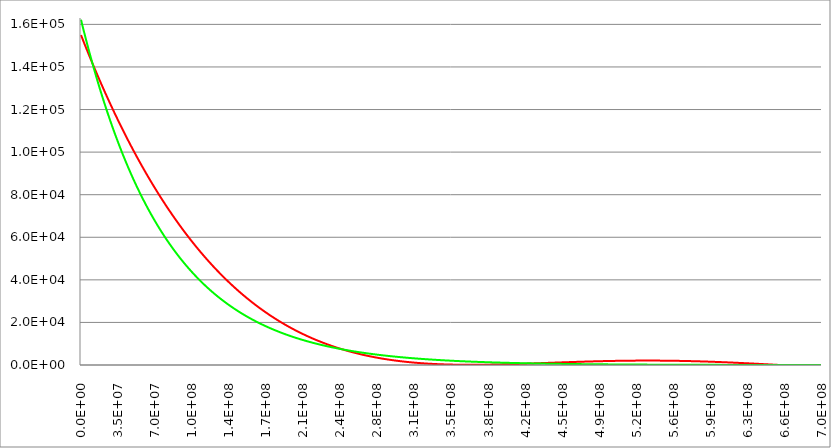
| Category | Series 1 | Series 0 | Series 2 |
|---|---|---|---|
| 0.0 | 155000 | 162200 |  |
| 347850.0 | 154555.961 | 161490.775 |  |
| 695700.0 | 154112.842 | 160784.651 |  |
| 1043550.0 | 153670.644 | 160081.614 |  |
| 1391400.0 | 153229.363 | 159381.651 |  |
| 1739250.0 | 152789 | 158684.748 |  |
| 2087100.0 | 152349.552 | 157990.891 |  |
| 2434950.0 | 151911.019 | 157300.068 |  |
| 2782800.0 | 151473.4 | 156612.265 |  |
| 3130650.0 | 151036.693 | 155927.469 |  |
| 3478500.0 | 150600.897 | 155245.667 |  |
| 3826350.0 | 150166.01 | 154566.846 |  |
| 4174200.0 | 149732.033 | 153890.992 |  |
| 4522050.0 | 149298.962 | 153218.093 |  |
| 4869900.0 | 148866.798 | 152548.136 |  |
| 5217750.0 | 148435.539 | 151881.108 |  |
| 5565600.0 | 148005.184 | 151216.996 |  |
| 5913450.0 | 147575.731 | 150555.787 |  |
| 6261300.0 | 147147.179 | 149897.47 |  |
| 6609150.0 | 146719.528 | 149242.03 |  |
| 6957000.0 | 146292.775 | 148589.455 |  |
| 7304850.0 | 145866.92 | 147939.734 |  |
| 7652700.0 | 145441.962 | 147292.853 |  |
| 8000550.0 | 145017.899 | 146648.8 |  |
| 8348400.0 | 144594.73 | 146007.563 |  |
| 8696250.0 | 144172.454 | 145369.129 |  |
| 9044100.0 | 143751.07 | 144733.487 |  |
| 9391950.0 | 143330.576 | 144100.623 |  |
| 9739800.0 | 142910.971 | 143470.526 |  |
| 10087650.0 | 142492.255 | 142843.184 |  |
| 10435500.0 | 142074.425 | 142218.584 |  |
| 10783350.0 | 141657.481 | 141596.715 |  |
| 11131200.0 | 141241.422 | 140977.565 |  |
| 11479050.0 | 140826.245 | 140361.122 |  |
| 11826900.0 | 140411.951 | 139747.373 |  |
| 12174750.0 | 139998.538 | 139136.308 |  |
| 12522600.0 | 139586.004 | 138527.914 |  |
| 12870450.0 | 139174.349 | 137922.18 |  |
| 13218300.0 | 138763.571 | 137319.095 |  |
| 13566150.0 | 138353.67 | 136718.646 |  |
| 13914000.0 | 137944.643 | 136120.822 |  |
| 14261850.0 | 137536.49 | 135525.611 |  |
| 14609700.0 | 137129.21 | 134933.003 |  |
| 14957550.0 | 136722.8 | 134342.985 |  |
| 15305400.0 | 136317.261 | 133755.547 |  |
| 15653250.0 | 135912.591 | 133170.677 |  |
| 16001100.0 | 135508.789 | 132588.365 |  |
| 16348950.0 | 135105.853 | 132008.598 |  |
| 16696800.0 | 134703.783 | 131431.365 |  |
| 17044650.0 | 134302.577 | 130856.656 |  |
| 17392500.0 | 133902.234 | 130284.46 |  |
| 17740350.0 | 133502.753 | 129714.765 |  |
| 18088200.0 | 133104.132 | 129147.561 |  |
| 18436050.0 | 132706.371 | 128582.837 |  |
| 18783900.0 | 132309.469 | 128020.581 |  |
| 19131750.0 | 131913.423 | 127460.784 |  |
| 19479600.0 | 131518.233 | 126903.434 |  |
| 19827450.0 | 131123.898 | 126348.52 |  |
| 20175300.0 | 130730.417 | 125796.033 |  |
| 20523150.0 | 130337.788 | 125245.961 |  |
| 20871000.0 | 129946.01 | 124698.293 |  |
| 21218850.0 | 129555.083 | 124153.021 |  |
| 21566700.0 | 129165.004 | 123610.132 |  |
| 21914550.0 | 128775.773 | 123069.616 |  |
| 22262400.0 | 128387.388 | 122531.463 |  |
| 22610250.0 | 127999.849 | 121995.664 |  |
| 22958100.0 | 127613.154 | 121462.206 |  |
| 23305950.0 | 127227.302 | 120931.081 |  |
| 23653800.0 | 126842.292 | 120402.278 |  |
| 24001650.0 | 126458.123 | 119875.786 |  |
| 24349500.0 | 126074.793 | 119351.597 |  |
| 24697350.0 | 125692.301 | 118829.699 |  |
| 25045200.0 | 125310.646 | 118310.082 |  |
| 25393050.0 | 124929.828 | 117792.738 |  |
| 25740900.0 | 124549.844 | 117277.655 |  |
| 26088750.0 | 124170.694 | 116764.824 |  |
| 26436600.0 | 123792.377 | 116254.235 |  |
| 26784450.0 | 123414.891 | 115745.878 |  |
| 27132300.0 | 123038.235 | 115239.744 |  |
| 27480150.0 | 122662.408 | 114735.822 |  |
| 27828000.0 | 122287.409 | 114234.104 |  |
| 28175850.0 | 121913.236 | 113734.579 |  |
| 28523700.0 | 121539.889 | 113237.238 |  |
| 28871550.0 | 121167.367 | 112742.071 |  |
| 29219400.0 | 120795.668 | 112249.069 |  |
| 29567250.0 | 120424.79 | 111758.222 |  |
| 29915100.0 | 120054.734 | 111269.521 |  |
| 30262950.0 | 119685.497 | 110782.957 |  |
| 30610800.0 | 119317.079 | 110298.52 |  |
| 30958650.0 | 118949.479 | 109816.2 |  |
| 31306500.0 | 118582.694 | 109335.99 |  |
| 31654350.0 | 118216.725 | 108857.878 |  |
| 32002200.0 | 117851.57 | 108381.857 |  |
| 32350050.0 | 117487.228 | 107907.917 |  |
| 32697900.0 | 117123.697 | 107436.049 |  |
| 33045750.0 | 116760.977 | 106966.244 |  |
| 33393600.0 | 116399.066 | 106498.493 |  |
| 33741450.0 | 116037.964 | 106032.787 |  |
| 34089300.0 | 115677.668 | 105569.117 |  |
| 34437150.0 | 115318.179 | 105107.474 |  |
| 34785000.0 | 114959.494 | 104647.849 |  |
| 35132850.0 | 114601.613 | 104190.234 |  |
| 35480700.0 | 114244.534 | 103734.619 |  |
| 35828550.0 | 113888.257 | 103280.996 |  |
| 36176400.0 | 113532.78 | 102829.356 |  |
| 36524250.0 | 113178.102 | 102379.691 |  |
| 36872100.0 | 112824.222 | 101931.992 |  |
| 37219950.0 | 112471.138 | 101486.25 |  |
| 37567800.0 | 112118.851 | 101042.456 |  |
| 37915650.0 | 111767.358 | 100600.603 |  |
| 38263500.0 | 111416.658 | 100160.682 |  |
| 38611350.0 | 111066.75 | 99722.684 |  |
| 38959200.0 | 110717.634 | 99286.6 |  |
| 39307050.0 | 110369.308 | 98852.423 |  |
| 39654900.0 | 110021.77 | 98420.145 |  |
| 40002750.0 | 109675.02 | 97989.756 |  |
| 40350600.0 | 109329.057 | 97561.249 |  |
| 40698450.0 | 108983.879 | 97134.615 |  |
| 41046300.0 | 108639.485 | 96709.846 |  |
| 41394150.0 | 108295.875 | 96286.934 |  |
| 41742000.0 | 107953.046 | 95865.872 |  |
| 42089850.0 | 107610.999 | 95446.65 |  |
| 42437700.0 | 107269.731 | 95029.261 |  |
| 42785550.0 | 106929.242 | 94613.696 |  |
| 43133400.0 | 106589.53 | 94199.949 |  |
| 43481250.0 | 106250.595 | 93788.01 |  |
| 43829100.0 | 105912.435 | 93377.872 |  |
| 44176950.0 | 105575.049 | 92969.527 |  |
| 44524800.0 | 105238.437 | 92562.968 |  |
| 44872650.0 | 104902.596 | 92158.185 |  |
| 45220500.0 | 104567.526 | 91755.173 |  |
| 45568350.0 | 104233.225 | 91353.922 |  |
| 45916200.0 | 103899.693 | 90954.426 |  |
| 46264050.0 | 103566.929 | 90556.676 |  |
| 46611900.0 | 103234.931 | 90160.665 |  |
| 46959750.0 | 102903.698 | 89766.386 |  |
| 47307600.0 | 102573.229 | 89373.83 |  |
| 47655450.0 | 102243.523 | 88982.99 |  |
| 48003300.0 | 101914.579 | 88593.859 |  |
| 48351150.0 | 101586.395 | 88206.429 |  |
| 48699000.0 | 101258.971 | 87820.693 |  |
| 49046850.0 | 100932.306 | 87436.643 |  |
| 49394700.0 | 100606.398 | 87054.273 |  |
| 49742550.0 | 100281.246 | 86673.574 |  |
| 50090400.0 | 99956.849 | 86294.539 |  |
| 50438250.0 | 99633.207 | 85917.162 |  |
| 50786100.0 | 99310.317 | 85541.434 |  |
| 51133950.0 | 98988.179 | 85167.349 |  |
| 51481800.0 | 98666.792 | 84794.899 |  |
| 51829650.0 | 98346.154 | 84424.078 |  |
| 52177500.0 | 98026.265 | 84054.878 |  |
| 52525350.0 | 97707.124 | 83687.292 |  |
| 52873200.0 | 97388.728 | 83321.313 |  |
| 53221050.0 | 97071.078 | 82956.934 |  |
| 53568900.0 | 96754.172 | 82594.148 |  |
| 53916750.0 | 96438.008 | 82232.948 |  |
| 54264600.0 | 96122.587 | 81873.327 |  |
| 54612450.0 | 95807.906 | 81515.278 |  |
| 54960300.0 | 95493.966 | 81158.795 |  |
| 55308150.0 | 95180.763 | 80803.87 |  |
| 55656000.0 | 94868.298 | 80450.497 |  |
| 56003850.0 | 94556.57 | 80098.669 |  |
| 56351700.0 | 94245.576 | 79748.378 |  |
| 56699550.0 | 93935.317 | 79399.62 |  |
| 57047400.0 | 93625.791 | 79052.386 |  |
| 57395250.0 | 93316.997 | 78706.67 |  |
| 57743100.0 | 93008.934 | 78362.465 |  |
| 58090950.0 | 92701.601 | 78019.766 |  |
| 58438800.0 | 92394.996 | 77678.564 |  |
| 58786650.0 | 92089.119 | 77338.854 |  |
| 59134500.0 | 91783.968 | 77000.63 |  |
| 59482350.0 | 91479.543 | 76663.884 |  |
| 59830200.0 | 91175.842 | 76328.61 |  |
| 60178050.0 | 90872.865 | 75994.802 |  |
| 60525900.0 | 90570.609 | 75662.453 |  |
| 60873750.0 | 90269.075 | 75331.558 |  |
| 61221600.0 | 89968.261 | 75002.109 |  |
| 61569450.0 | 89668.165 | 74674.1 |  |
| 61917300.0 | 89368.788 | 74347.525 |  |
| 62265150.0 | 89070.127 | 74022.378 |  |
| 62613000.0 | 88772.182 | 73698.653 |  |
| 62960850.0 | 88474.951 | 73376.342 |  |
| 63308700.0 | 88178.434 | 73055.441 |  |
| 63656550.0 | 87882.629 | 72735.943 |  |
| 64004400.0 | 87587.535 | 72417.842 |  |
| 64352250.0 | 87293.152 | 72101.131 |  |
| 64700100.0 | 86999.478 | 71785.805 |  |
| 65047950.0 | 86706.512 | 71471.857 |  |
| 65395800.0 | 86414.253 | 71159.282 |  |
| 65743650.0 | 86122.7 | 70848.074 |  |
| 66091500.0 | 85831.852 | 70538.226 |  |
| 66439350.0 | 85541.707 | 70229.732 |  |
| 66787200.0 | 85252.265 | 69922.588 |  |
| 67135050.0 | 84963.525 | 69616.786 |  |
| 67482900.0 | 84675.486 | 69312.321 |  |
| 67830750.0 | 84388.146 | 69009.187 |  |
| 68178600.0 | 84101.504 | 68707.379 |  |
| 68526450.0 | 83815.56 | 68406.889 |  |
| 68874300.0 | 83530.312 | 68107.714 |  |
| 69222150.0 | 83245.759 | 67809.846 |  |
| 69570000.0 | 82961.9 | 67513.281 |  |
| 69917850.0 | 82678.734 | 67218.012 |  |
| 70265700.0 | 82396.261 | 66924.035 |  |
| 70613550.0 | 82114.478 | 66631.342 |  |
| 70961400.0 | 81833.385 | 66339.929 |  |
| 71309250.0 | 81552.981 | 66049.79 |  |
| 71657100.0 | 81273.265 | 65760.919 |  |
| 72004950.0 | 80994.235 | 65473.312 |  |
| 72352800.0 | 80715.891 | 65186.961 |  |
| 72700650.0 | 80438.232 | 64901.863 |  |
| 73048500.0 | 80161.256 | 64618.011 |  |
| 73396350.0 | 79884.963 | 64335.4 |  |
| 73744200.0 | 79609.35 | 64054.024 |  |
| 74092050.0 | 79334.419 | 63773.879 |  |
| 74439900.0 | 79060.166 | 63494.958 |  |
| 74787750.0 | 78786.592 | 63217.257 |  |
| 75135600.0 | 78513.695 | 62940.77 |  |
| 75483450.0 | 78241.474 | 62665.492 |  |
| 75831300.0 | 77969.928 | 62391.417 |  |
| 76179150.0 | 77699.056 | 62118.54 |  |
| 76527000.0 | 77428.857 | 61846.856 |  |
| 76874850.0 | 77159.33 | 61576.36 |  |
| 77222700.0 | 76890.473 | 61307.047 |  |
| 77570550.0 | 76622.287 | 61038.911 |  |
| 77918400.0 | 76354.769 | 60771.947 |  |
| 78266250.0 | 76087.919 | 60506.15 |  |
| 78614100.0 | 75821.735 | 60241.516 |  |
| 78961950.0 | 75556.218 | 59978.038 |  |
| 79309800.0 | 75291.364 | 59715.712 |  |
| 79657650.0 | 75027.175 | 59454.533 |  |
| 80005500.0 | 74763.647 | 59194.496 |  |
| 80353350.0 | 74500.781 | 58935.596 |  |
| 80701200.0 | 74238.576 | 58677.828 |  |
| 81049050.0 | 73977.029 | 58421.186 |  |
| 81396900.0 | 73716.142 | 58165.667 |  |
| 81744750.0 | 73455.911 | 57911.264 |  |
| 82092600.0 | 73196.336 | 57657.974 |  |
| 82440450.0 | 72937.417 | 57405.791 |  |
| 82788300.0 | 72679.152 | 57154.711 |  |
| 83136150.0 | 72421.54 | 56904.728 |  |
| 83484000.0 | 72164.58 | 56655.838 |  |
| 83831850.0 | 71908.271 | 56408.037 |  |
| 84179700.0 | 71652.612 | 56161.319 |  |
| 84527550.0 | 71397.602 | 55915.679 |  |
| 84875400.0 | 71143.24 | 55671.113 |  |
| 85223250.0 | 70889.524 | 55427.616 |  |
| 85571100.0 | 70636.455 | 55185.184 |  |
| 85918950.0 | 70384.03 | 54943.812 |  |
| 86266800.0 | 70132.25 | 54703.495 |  |
| 86614650.0 | 69881.112 | 54464.229 |  |
| 86962500.0 | 69630.615 | 54226.009 |  |
| 87310350.0 | 69380.76 | 53988.83 |  |
| 87658200.0 | 69131.544 | 53752.688 |  |
| 88006050.0 | 68882.966 | 53517.579 |  |
| 88353900.0 | 68635.027 | 53283.497 |  |
| 88701750.0 | 68387.724 | 53050.439 |  |
| 89049600.0 | 68141.056 | 52818.399 |  |
| 89397450.0 | 67895.023 | 52587.374 |  |
| 89745300.0 | 67649.624 | 52357.359 |  |
| 90093150.0 | 67404.857 | 52128.35 |  |
| 90441000.0 | 67160.722 | 51900.342 |  |
| 90788850.0 | 66917.217 | 51673.331 |  |
| 91136700.0 | 66674.341 | 51447.312 |  |
| 91484550.0 | 66432.094 | 51222.281 |  |
| 91832400.0 | 66190.474 | 50998.234 |  |
| 92180250.0 | 65949.481 | 50775.167 |  |
| 92528100.0 | 65709.113 | 50553.074 |  |
| 92875950.0 | 65469.37 | 50331.953 |  |
| 93223800.0 | 65230.249 | 50111.798 |  |
| 93571650.0 | 64991.751 | 49892.606 |  |
| 93919500.0 | 64753.875 | 49674.372 |  |
| 94267350.0 | 64516.619 | 49457.093 |  |
| 94615200.0 | 64279.982 | 49240.763 |  |
| 94963050.0 | 64043.963 | 49025.379 |  |
| 95310900.0 | 63808.562 | 48810.936 |  |
| 95658750.0 | 63573.776 | 48597.431 |  |
| 96006600.0 | 63339.606 | 48384.86 |  |
| 96354450.0 | 63106.051 | 48173.218 |  |
| 96702300.0 | 62873.108 | 47962.501 |  |
| 97050150.0 | 62640.778 | 47752.705 |  |
| 97398000.0 | 62409.059 | 47543.827 |  |
| 97745850.0 | 62177.95 | 47335.861 |  |
| 98093700.0 | 61947.451 | 47128.805 |  |
| 98441550.0 | 61717.559 | 46922.654 |  |
| 98789400.0 | 61488.275 | 46717.405 |  |
| 99137250.0 | 61259.597 | 46513.052 |  |
| 99485100.0 | 61031.524 | 46309.593 |  |
| 99832950.0 | 60804.056 | 46107.024 |  |
| 100180800.0 | 60577.191 | 45905.34 |  |
| 100528650.0 | 60350.927 | 45704.538 |  |
| 100876500.0 | 60125.266 | 45504.614 |  |
| 101224350.0 | 59900.204 | 45305.564 |  |
| 101572200.0 | 59675.741 | 45107.384 |  |
| 101920050.0 | 59451.877 | 44910.07 |  |
| 102267900.0 | 59228.61 | 44713.619 |  |
| 102615750.0 | 59005.939 | 44518.027 |  |
| 102963600.0 | 58783.864 | 44323.29 |  |
| 103311450.0 | 58562.382 | 44129.404 |  |
| 103659300.0 | 58341.494 | 43936.366 |  |
| 104007150.0 | 58121.198 | 43744.172 |  |
| 104355000.0 | 57901.494 | 43552.819 |  |
| 104702850.0 | 57682.379 | 43362.301 |  |
| 105050700.0 | 57463.854 | 43172.617 |  |
| 105398550.0 | 57245.918 | 42983.762 |  |
| 105746400.0 | 57028.568 | 42795.733 |  |
| 106094250.0 | 56811.805 | 42608.525 |  |
| 106442100.0 | 56595.628 | 42422.136 |  |
| 106789950.0 | 56380.034 | 42236.562 |  |
| 107137800.0 | 56165.025 | 42051.799 |  |
| 107485650.0 | 55950.597 | 41867.844 |  |
| 107833500.0 | 55736.751 | 41684.694 |  |
| 108181350.0 | 55523.485 | 41502.344 |  |
| 108529200.0 | 55310.799 | 41320.791 |  |
| 108877050.0 | 55098.691 | 41140.032 |  |
| 109224900.0 | 54887.161 | 40960.063 |  |
| 109572750.0 | 54676.207 | 40780.881 |  |
| 109920600.0 | 54465.829 | 40602.482 |  |
| 110268450.0 | 54256.025 | 40424.863 |  |
| 110616300.0 | 54046.795 | 40248.021 |  |
| 110964150.0 | 53838.138 | 40071.952 |  |
| 111312000.0 | 53630.052 | 39896.652 |  |
| 111659850.0 | 53422.537 | 39722.119 |  |
| 112007700.0 | 53215.591 | 39548.349 |  |
| 112355550.0 | 53009.214 | 39375.339 |  |
| 112703400.0 | 52803.405 | 39203.085 |  |
| 113051250.0 | 52598.163 | 39031.584 |  |
| 113399100.0 | 52393.487 | 38860.833 |  |
| 113746950.0 | 52189.375 | 38690.828 |  |
| 114094800.0 | 51985.827 | 38521.567 |  |
| 114442650.0 | 51782.842 | 38353.046 |  |
| 114790500.0 | 51580.419 | 38185.261 |  |
| 115138350.0 | 51378.557 | 38018.21 |  |
| 115486200.0 | 51177.255 | 37851.889 |  |
| 115834050.0 | 50976.512 | 37686.295 |  |
| 116181900.0 | 50776.328 | 37521.426 |  |
| 116529750.0 | 50576.7 | 37357.277 |  |
| 116877600.0 | 50377.628 | 37193.846 |  |
| 117225450.0 | 50179.112 | 37031.129 |  |
| 117573300.0 | 49981.15 | 36869.123 |  |
| 117921150.0 | 49783.741 | 36707.826 |  |
| 118269000.0 | 49586.884 | 36547.234 |  |
| 118616850.0 | 49390.579 | 36387.344 |  |
| 118964700.0 | 49194.824 | 36228.154 |  |
| 119312550.0 | 48999.618 | 36069.659 |  |
| 119660400.0 | 48804.961 | 35911.857 |  |
| 120008250.0 | 48610.852 | 35754.745 |  |
| 120356100.0 | 48417.289 | 35598.319 |  |
| 120703950.0 | 48224.272 | 35442.578 |  |
| 121051800.0 | 48031.799 | 35287.517 |  |
| 121399650.0 | 47839.87 | 35133.135 |  |
| 121747500.0 | 47648.484 | 34979.427 |  |
| 122095350.0 | 47457.64 | 34826.391 |  |
| 122443200.0 | 47267.336 | 34674.025 |  |
| 122791050.0 | 47077.573 | 34522.324 |  |
| 123138900.0 | 46888.348 | 34371.287 |  |
| 123486750.0 | 46699.661 | 34220.91 |  |
| 123834600.0 | 46511.512 | 34071.191 |  |
| 124182450.0 | 46323.898 | 33922.125 |  |
| 124530300.0 | 46136.82 | 33773.712 |  |
| 124878150.0 | 45950.276 | 33625.948 |  |
| 125226000.0 | 45764.265 | 33478.829 |  |
| 125573850.0 | 45578.787 | 33332.354 |  |
| 125921700.0 | 45393.84 | 33186.519 |  |
| 126269550.0 | 45209.424 | 33041.322 |  |
| 126617400.0 | 45025.537 | 32896.759 |  |
| 126965250.0 | 44842.178 | 32752.829 |  |
| 127313100.0 | 44659.347 | 32609.527 |  |
| 127660950.0 | 44477.043 | 32466.852 |  |
| 128008800.0 | 44295.265 | 32324.801 |  |
| 128356650.0 | 44114.012 | 32183.371 |  |
| 128704500.0 | 43933.282 | 32042.559 |  |
| 129052350.0 | 43753.076 | 31902.363 |  |
| 129400200.0 | 43573.391 | 31762.78 |  |
| 129748050.0 | 43394.228 | 31623.807 |  |
| 130095900.0 | 43215.584 | 31485.442 |  |
| 130443750.0 | 43037.46 | 31347.681 |  |
| 130791600.0 | 42859.855 | 31210.523 |  |
| 131139450.0 | 42682.766 | 31073.964 |  |
| 131487300.0 | 42506.194 | 30938.003 |  |
| 131835150.0 | 42330.138 | 30802.636 |  |
| 132183000.0 | 42154.596 | 30667.86 |  |
| 132530850.0 | 41979.568 | 30533.674 |  |
| 132878700.0 | 41805.052 | 30400.075 |  |
| 133226550.0 | 41631.049 | 30267.059 |  |
| 133574400.0 | 41457.556 | 30134.625 |  |
| 133922250.0 | 41284.573 | 30002.77 |  |
| 134270100.0 | 41112.099 | 29871.492 |  |
| 134617950.0 | 40940.134 | 29740.787 |  |
| 134965800.0 | 40768.675 | 29610.654 |  |
| 135313650.0 | 40597.723 | 29481.09 |  |
| 135661500.0 | 40427.276 | 29352.092 |  |
| 136009350.0 | 40257.334 | 29223.658 |  |
| 136357200.0 | 40087.895 | 29095.786 |  |
| 136705050.0 | 39918.959 | 28968.473 |  |
| 137052900.0 | 39750.524 | 28841.716 |  |
| 137400750.0 | 39582.59 | 28715.513 |  |
| 137748600.0 | 39415.156 | 28589.863 |  |
| 138096450.0 | 39248.221 | 28464.761 |  |
| 138444300.0 | 39081.784 | 28340.207 |  |
| 138792150.0 | 38915.844 | 28216.197 |  |
| 139140000.0 | 38750.4 | 28092.729 |  |
| 139487850.0 | 38585.451 | 27969.801 |  |
| 139835700.0 | 38420.997 | 27847.41 |  |
| 140183550.0 | 38257.037 | 27725.554 |  |
| 140531400.0 | 38093.569 | 27604.232 |  |
| 140879250.0 | 37930.592 | 27483.439 |  |
| 141227100.0 | 37768.106 | 27363.175 |  |
| 141574950.0 | 37606.11 | 27243.436 |  |
| 141922800.0 | 37444.603 | 27124.221 |  |
| 142270650.0 | 37283.584 | 27005.527 |  |
| 142618500.0 | 37123.052 | 26887.352 |  |
| 142966350.0 | 36963.007 | 26769.694 |  |
| 143314200.0 | 36803.446 | 26652.55 |  |
| 143662050.0 | 36644.37 | 26535.918 |  |
| 144009900.0 | 36485.778 | 26419.796 |  |
| 144357750.0 | 36327.668 | 26304.182 |  |
| 144705600.0 | 36170.04 | 26189.073 |  |
| 145053450.0 | 36012.893 | 26074.467 |  |
| 145401300.0 | 35856.225 | 25960.363 |  |
| 145749150.0 | 35700.037 | 25846.757 |  |
| 146097000.0 | 35544.326 | 25733.648 |  |
| 146444850.0 | 35389.093 | 25621.034 |  |
| 146792700.0 | 35234.336 | 25508.911 |  |
| 147140550.0 | 35080.055 | 25397.279 |  |
| 147488400.0 | 34926.248 | 25286.135 |  |
| 147836250.0 | 34772.915 | 25175.477 |  |
| 148184100.0 | 34620.055 | 25065.303 |  |
| 148531950.0 | 34467.666 | 24955.61 |  |
| 148879800.0 | 34315.748 | 24846.397 |  |
| 149227650.0 | 34164.301 | 24737.662 |  |
| 149575500.0 | 34013.322 | 24629.401 |  |
| 149923350.0 | 33862.812 | 24521.614 |  |
| 150271200.0 | 33712.77 | 24414.299 |  |
| 150619050.0 | 33563.193 | 24307.452 |  |
| 150966900.0 | 33414.083 | 24201.073 |  |
| 151314750.0 | 33265.437 | 24095.158 |  |
| 151662600.0 | 33117.255 | 23989.707 |  |
| 152010450.0 | 32969.536 | 23884.717 |  |
| 152358300.0 | 32822.279 | 23780.186 |  |
| 152706150.0 | 32675.484 | 23676.111 |  |
| 153054000.0 | 32529.149 | 23572.492 |  |
| 153401850.0 | 32383.273 | 23469.326 |  |
| 153749700.0 | 32237.856 | 23366.61 |  |
| 154097550.0 | 32092.896 | 23264.344 |  |
| 154445400.0 | 31948.393 | 23162.525 |  |
| 154793250.0 | 31804.347 | 23061.151 |  |
| 155141100.0 | 31660.755 | 22960.22 |  |
| 155488950.0 | 31517.618 | 22859.731 |  |
| 155836800.0 | 31374.933 | 22759.681 |  |
| 156184650.0 | 31232.702 | 22660.068 |  |
| 156532500.0 | 31090.921 | 22560.89 |  |
| 156880350.0 | 30949.592 | 22462.147 |  |
| 157228200.0 | 30808.712 | 22363.835 |  |
| 157576050.0 | 30668.282 | 22265.952 |  |
| 157923900.0 | 30528.299 | 22168.498 |  |
| 158271750.0 | 30388.764 | 22071.47 |  |
| 158619600.0 | 30249.675 | 21974.866 |  |
| 158967450.0 | 30111.031 | 21878.684 |  |
| 159315300.0 | 29972.832 | 21782.923 |  |
| 159663150.0 | 29835.077 | 21687.58 |  |
| 160011000.0 | 29697.765 | 21592.655 |  |
| 160358850.0 | 29560.894 | 21498.144 |  |
| 160706700.0 | 29424.465 | 21404.046 |  |
| 161054550.0 | 29288.477 | 21310.36 |  |
| 161402400.0 | 29152.927 | 21217.083 |  |
| 161750250.0 | 29017.816 | 21124.215 |  |
| 162098100.0 | 28883.143 | 21031.752 |  |
| 162445950.0 | 28748.907 | 20939.693 |  |
| 162793800.0 | 28615.106 | 20848.037 |  |
| 163141650.0 | 28481.741 | 20756.782 |  |
| 163489500.0 | 28348.81 | 20665.925 |  |
| 163837350.0 | 28216.313 | 20575.466 |  |
| 164185200.0 | 28084.248 | 20485.402 |  |
| 164533050.0 | 27952.614 | 20395.732 |  |
| 164880900.0 | 27821.412 | 20306.454 |  |
| 165228750.0 | 27690.64 | 20217.567 |  |
| 165576600.0 | 27560.296 | 20129.068 |  |
| 165924450.0 | 27430.381 | 20040.956 |  |
| 166272300.0 | 27300.894 | 19953.229 |  |
| 166620150.0 | 27171.833 | 19865.885 |  |
| 166968000.0 | 27043.197 | 19778.924 |  |
| 167315850.0 | 26914.987 | 19692.342 |  |
| 167663700.0 | 26787.201 | 19606.139 |  |
| 168011550.0 | 26659.838 | 19520.313 |  |
| 168359400.0 | 26532.897 | 19434.863 |  |
| 168707250.0 | 26406.377 | 19349.785 |  |
| 169055100.0 | 26280.279 | 19265.08 |  |
| 169402950.0 | 26154.6 | 19180.745 |  |
| 169750800.0 | 26029.34 | 19096.779 |  |
| 170098650.0 | 25904.498 | 19013.18 |  |
| 170446500.0 | 25780.074 | 18929.946 |  |
| 170794350.0 | 25656.065 | 18847.076 |  |
| 171142200.0 | 25532.473 | 18764.569 |  |
| 171490050.0 | 25409.295 | 18682.422 |  |
| 171837900.0 | 25286.531 | 18600.634 |  |
| 172185750.0 | 25164.181 | 18519.204 |  |
| 172533600.0 | 25042.242 | 18438.13 |  |
| 172881450.0 | 24920.715 | 18357.41 |  |
| 173229300.0 | 24799.598 | 18277.044 |  |
| 173577150.0 | 24678.892 | 18197.028 |  |
| 173925000.0 | 24558.594 | 18117.363 |  |
| 174272850.0 | 24438.704 | 18038.045 |  |
| 174620700.0 | 24319.221 | 17959.075 |  |
| 174968550.0 | 24200.145 | 17880.45 |  |
| 175316400.0 | 24081.474 | 17802.168 |  |
| 175664250.0 | 23963.208 | 17724.229 |  |
| 176012100.0 | 23845.346 | 17646.63 |  |
| 176359950.0 | 23727.887 | 17569.371 |  |
| 176707800.0 | 23610.831 | 17492.449 |  |
| 177055650.0 | 23494.176 | 17415.864 |  |
| 177403500.0 | 23377.921 | 17339.614 |  |
| 177751350.0 | 23262.066 | 17263.696 |  |
| 178099200.0 | 23146.61 | 17188.111 |  |
| 178447050.0 | 23031.552 | 17112.857 |  |
| 178794900.0 | 22916.892 | 17037.931 |  |
| 179142750.0 | 22802.627 | 16963.333 |  |
| 179490600.0 | 22688.759 | 16889.061 |  |
| 179838450.0 | 22575.285 | 16815.113 |  |
| 180186300.0 | 22462.206 | 16741.489 |  |
| 180534150.0 | 22349.519 | 16668.187 |  |
| 180882000.0 | 22237.225 | 16595.205 |  |
| 181229850.0 | 22125.323 | 16522.543 |  |
| 181577700.0 | 22013.811 | 16450.198 |  |
| 181925550.0 | 21902.689 | 16378.169 |  |
| 182273400.0 | 21791.957 | 16306.455 |  |
| 182621250.0 | 21681.612 | 16235.055 |  |
| 182969100.0 | 21571.655 | 16163.967 |  |
| 183316950.0 | 21462.085 | 16093.189 |  |
| 183664800.0 | 21352.901 | 16022.721 |  |
| 184012650.0 | 21244.101 | 15952.562 |  |
| 184360500.0 | 21135.686 | 15882.708 |  |
| 184708350.0 | 21027.654 | 15813.161 |  |
| 185056200.0 | 20920.005 | 15743.917 |  |
| 185404050.0 | 20812.738 | 15674.976 |  |
| 185751900.0 | 20705.851 | 15606.336 |  |
| 186099750.0 | 20599.345 | 15537.997 |  |
| 186447600.0 | 20493.218 | 15469.956 |  |
| 186795450.0 | 20387.47 | 15402.213 |  |
| 187143300.0 | 20282.1 | 15334.766 |  |
| 187491150.0 | 20177.106 | 15267.614 |  |
| 187839000.0 | 20072.489 | 15200.755 |  |
| 188186850.0 | 19968.247 | 15134.189 |  |
| 188534700.0 | 19864.379 | 15067.914 |  |
| 188882550.0 | 19760.886 | 15001.928 |  |
| 189230400.0 | 19657.765 | 14936.231 |  |
| 189578250.0 | 19555.016 | 14870.821 |  |
| 189926100.0 | 19452.639 | 14805.697 |  |
| 190273950.0 | 19350.632 | 14740.858 |  |
| 190621800.0 | 19248.995 | 14676.302 |  |
| 190969650.0 | 19147.728 | 14612.029 |  |
| 191317500.0 | 19046.828 | 14548.036 |  |
| 191665350.0 | 18946.295 | 14484.323 |  |
| 192013200.0 | 18846.129 | 14420.889 |  |
| 192361050.0 | 18746.329 | 14357.732 |  |
| 192708900.0 | 18646.894 | 14294.852 |  |
| 193056750.0 | 18547.824 | 14232.246 |  |
| 193404600.0 | 18449.116 | 14169.913 |  |
| 193752450.0 | 18350.771 | 14107.854 |  |
| 194100300.0 | 18252.788 | 14046.066 |  |
| 194448150.0 | 18155.166 | 13984.547 |  |
| 194796000.0 | 18057.905 | 13923.298 |  |
| 195143850.0 | 17961.002 | 13862.317 |  |
| 195491700.0 | 17864.459 | 13801.602 |  |
| 195839550.0 | 17768.273 | 13741.152 |  |
| 196187400.0 | 17672.445 | 13680.967 |  |
| 196535250.0 | 17576.973 | 13621.045 |  |
| 196883100.0 | 17481.856 | 13561.385 |  |
| 197230950.0 | 17387.094 | 13501.986 |  |
| 197578800.0 | 17292.686 | 13442.846 |  |
| 197926650.0 | 17198.631 | 13383.965 |  |
| 198274500.0 | 17104.929 | 13325.341 |  |
| 198622350.0 | 17011.578 | 13266.974 |  |
| 198970200.0 | 16918.579 | 13208.862 |  |
| 199318050.0 | 16825.929 | 13151.004 |  |
| 199665900.0 | 16733.629 | 13093.399 |  |
| 200013750.0 | 16641.677 | 13036.045 |  |
| 200361600.0 | 16550.073 | 12978.943 |  |
| 200709450.0 | 16458.816 | 12922.09 |  |
| 201057300.0 | 16367.905 | 12865.486 |  |
| 201405150.0 | 16277.339 | 12809.129 |  |
| 201753000.0 | 16187.118 | 12753.018 |  |
| 202100850.0 | 16097.241 | 12697.153 |  |
| 202448700.0 | 16007.708 | 12641.532 |  |
| 202796550.0 | 15918.516 | 12586.154 |  |
| 203144400.0 | 15829.666 | 12531.019 |  |
| 203492250.0 | 15741.157 | 12476.124 |  |
| 203840100.0 | 15652.988 | 12421.469 |  |
| 204187950.0 | 15565.159 | 12367.054 |  |
| 204535800.0 | 15477.668 | 12312.876 |  |
| 204883650.0 | 15390.514 | 12258.935 |  |
| 205231500.0 | 15303.698 | 12205.23 |  |
| 205579350.0 | 15217.218 | 12151.759 |  |
| 205927200.0 | 15131.073 | 12098.523 |  |
| 206275050.0 | 15045.263 | 12045.519 |  |
| 206622900.0 | 14959.787 | 11992.747 |  |
| 206970750.0 | 14874.644 | 11940.205 |  |
| 207318600.0 | 14789.833 | 11887.894 |  |
| 207666450.0 | 14705.354 | 11835.811 |  |
| 208014300.0 | 14621.206 | 11783.955 |  |
| 208362150.0 | 14537.388 | 11732.327 |  |
| 208710000.0 | 14453.9 | 11680.924 |  |
| 209057850.0 | 14370.74 | 11629.746 |  |
| 209405700.0 | 14287.908 | 11578.791 |  |
| 209753550.0 | 14205.403 | 11528.06 |  |
| 210101400.0 | 14123.225 | 11477.55 |  |
| 210449250.0 | 14041.372 | 11427.261 |  |
| 210797100.0 | 13959.844 | 11377.191 |  |
| 211144950.0 | 13878.64 | 11327.341 |  |
| 211492800.0 | 13797.76 | 11277.709 |  |
| 211840650.0 | 13717.202 | 11228.293 |  |
| 212188500.0 | 13636.966 | 11179.094 |  |
| 212536350.0 | 13557.051 | 11130.11 |  |
| 212884200.0 | 13477.456 | 11081.34 |  |
| 213232050.0 | 13398.182 | 11032.783 |  |
| 213579900.0 | 13319.226 | 10984.438 |  |
| 213927750.0 | 13240.588 | 10936.305 |  |
| 214275600.0 | 13162.267 | 10888.382 |  |
| 214623450.0 | 13084.263 | 10840.669 |  |
| 214971300.0 | 13006.575 | 10793.164 |  |
| 215319150.0 | 12929.202 | 10745.867 |  |
| 215667000.0 | 12852.144 | 10698.777 |  |
| 216014850.0 | 12775.399 | 10651.893 |  |
| 216362700.0 | 12698.967 | 10605.213 |  |
| 216710550.0 | 12622.848 | 10558.738 |  |
| 217058400.0 | 12547.04 | 10512.466 |  |
| 217406250.0 | 12471.542 | 10466.396 |  |
| 217754100.0 | 12396.355 | 10420.527 |  |
| 218101950.0 | 12321.477 | 10374.86 |  |
| 218449800.0 | 12246.907 | 10329.391 |  |
| 218797650.0 | 12172.645 | 10284.122 |  |
| 219145500.0 | 12098.69 | 10239.05 |  |
| 219493350.0 | 12025.042 | 10194.176 |  |
| 219841200.0 | 11951.699 | 10149.497 |  |
| 220189050.0 | 11878.661 | 10105.014 |  |
| 220536900.0 | 11805.927 | 10060.726 |  |
| 220884750.0 | 11733.497 | 10016.631 |  |
| 221232600.0 | 11661.369 | 9972.729 |  |
| 221580450.0 | 11589.543 | 9929.019 |  |
| 221928300.0 | 11518.018 | 9885.5 |  |
| 222276150.0 | 11446.794 | 9842.171 |  |
| 222624000.0 | 11375.869 | 9799.031 |  |
| 222971850.0 | 11305.244 | 9756.08 |  |
| 223319700.0 | 11234.917 | 9713.317 |  |
| 223667550.0 | 11164.887 | 9670.741 |  |
| 224015400.0 | 11095.155 | 9628.351 |  |
| 224363250.0 | 11025.718 | 9586.147 |  |
| 224711100.0 | 10956.577 | 9544.127 |  |
| 225058950.0 | 10887.731 | 9502.29 |  |
| 225406800.0 | 10819.178 | 9460.637 |  |
| 225754650.0 | 10750.919 | 9419.165 |  |
| 226102500.0 | 10682.953 | 9377.875 |  |
| 226450350.0 | 10615.278 | 9336.766 |  |
| 226798200.0 | 10547.894 | 9295.836 |  |
| 227146050.0 | 10480.801 | 9255.085 |  |
| 227493900.0 | 10413.998 | 9214.512 |  |
| 227841750.0 | 10347.483 | 9174.117 |  |
| 228189600.0 | 10281.257 | 9133.898 |  |
| 228537450.0 | 10215.318 | 9093.855 |  |
| 228885300.0 | 10149.666 | 9053.987 |  |
| 229233150.0 | 10084.3 | 9014.293 |  |
| 229581000.0 | 10019.22 | 8974.773 |  |
| 229928850.0 | 9954.424 | 8935.426 |  |
| 230276700.0 | 9889.913 | 8896.251 |  |
| 230624550.0 | 9825.684 | 8857.247 |  |
| 230972400.0 | 9761.739 | 8818.413 |  |
| 231320250.0 | 9698.075 | 8779.75 |  |
| 231668100.0 | 9634.692 | 8741.255 |  |
| 232015950.0 | 9571.59 | 8702.928 |  |
| 232363800.0 | 9508.767 | 8664.77 |  |
| 232711650.0 | 9446.224 | 8626.778 |  |
| 233059500.0 | 9383.959 | 8588.952 |  |
| 233407350.0 | 9321.971 | 8551.291 |  |
| 233755200.0 | 9260.261 | 8513.795 |  |
| 234103050.0 | 9198.827 | 8476.463 |  |
| 234450900.0 | 9137.668 | 8439.295 |  |
| 234798750.0 | 9076.784 | 8402.288 |  |
| 235146600.0 | 9016.175 | 8365.444 |  |
| 235494450.0 | 8955.838 | 8328.76 |  |
| 235842300.0 | 8895.775 | 8292.237 |  |
| 236190150.0 | 8835.984 | 8255.874 |  |
| 236538000.0 | 8776.464 | 8219.67 |  |
| 236885850.0 | 8717.215 | 8183.624 |  |
| 237233700.0 | 8658.235 | 8147.735 |  |
| 237581550.0 | 8599.525 | 8112.004 |  |
| 237929400.0 | 8541.084 | 8076.428 |  |
| 238277250.0 | 8482.911 | 8041.008 |  |
| 238625100.0 | 8425.005 | 8005.743 |  |
| 238972950.0 | 8367.365 | 7970.632 |  |
| 239320800.0 | 8309.991 | 7935.675 |  |
| 239668650.0 | 8252.883 | 7900.871 |  |
| 240016500.0 | 8196.039 | 7866.218 |  |
| 240364350.0 | 8139.458 | 7831.717 |  |
| 240712200.0 | 8083.141 | 7797.367 |  |
| 241060050.0 | 8027.086 | 7763.167 |  |
| 241407900.0 | 7971.293 | 7729.117 |  |
| 241755750.0 | 7915.761 | 7695.216 |  |
| 242103600.0 | 7860.49 | 7661.462 |  |
| 242451450.0 | 7805.478 | 7627.857 |  |
| 242799300.0 | 7750.725 | 7594.398 |  |
| 243147150.0 | 7696.231 | 7561.085 |  |
| 243495000.0 | 7641.994 | 7527.919 |  |
| 243842850.0 | 7588.014 | 7494.897 |  |
| 244190700.0 | 7534.29 | 7462.019 |  |
| 244538550.0 | 7480.822 | 7429.285 |  |
| 244886400.0 | 7427.609 | 7396.695 |  |
| 245234250.0 | 7374.651 | 7364.247 |  |
| 245582100.0 | 7321.946 | 7331.94 |  |
| 245929950.0 | 7269.493 | 7299.775 |  |
| 246277800.0 | 7217.294 | 7267.751 |  |
| 246625650.0 | 7165.345 | 7235.866 |  |
| 246973500.0 | 7113.648 | 7204.121 |  |
| 247321350.0 | 7062.201 | 7172.515 |  |
| 247669200.0 | 7011.003 | 7141.047 |  |
| 248017050.0 | 6960.054 | 7109.716 |  |
| 248364900.0 | 6909.354 | 7078.523 |  |
| 248712750.0 | 6858.901 | 7047.466 |  |
| 249060600.0 | 6808.695 | 7016.544 |  |
| 249408450.0 | 6758.735 | 6985.758 |  |
| 249756300.0 | 6709.021 | 6955.106 |  |
| 250104150.0 | 6659.552 | 6924.589 |  |
| 250452000.0 | 6610.327 | 6894.205 |  |
| 250799850.0 | 6561.346 | 6863.953 |  |
| 251147700.0 | 6512.607 | 6833.834 |  |
| 251495550.0 | 6464.111 | 6803.847 |  |
| 251843400.0 | 6415.856 | 6773.99 |  |
| 252191250.0 | 6367.843 | 6744.265 |  |
| 252539100.0 | 6320.069 | 6714.669 |  |
| 252886950.0 | 6272.536 | 6685.202 |  |
| 253234800.0 | 6225.241 | 6655.865 |  |
| 253582650.0 | 6178.184 | 6626.655 |  |
| 253930500.0 | 6131.366 | 6597.574 |  |
| 254278350.0 | 6084.784 | 6568.619 |  |
| 254626200.0 | 6038.438 | 6539.791 |  |
| 254974050.0 | 5992.329 | 6511.089 |  |
| 255321900.0 | 5946.454 | 6482.513 |  |
| 255669750.0 | 5900.814 | 6454.061 |  |
| 256017600.0 | 5855.407 | 6425.734 |  |
| 256365450.0 | 5810.234 | 6397.531 |  |
| 256713300.0 | 5765.293 | 6369.451 |  |
| 257061150.0 | 5720.584 | 6341.494 |  |
| 257409000.0 | 5676.106 | 6313.659 |  |
| 257756850.0 | 5631.858 | 6285.945 |  |
| 258104700.0 | 5587.84 | 6258.353 |  |
| 258452550.0 | 5544.052 | 6230.882 |  |
| 258800400.0 | 5500.492 | 6203.53 |  |
| 259148250.0 | 5457.16 | 6176.299 |  |
| 259496100.0 | 5414.055 | 6149.186 |  |
| 259843950.0 | 5371.177 | 6122.191 |  |
| 260191800.0 | 5328.525 | 6095.315 |  |
| 260539650.0 | 5286.098 | 6068.556 |  |
| 260887500.0 | 5243.896 | 6041.915 |  |
| 261235350.0 | 5201.919 | 6015.389 |  |
| 261583200.0 | 5160.164 | 5988.98 |  |
| 261931050.0 | 5118.632 | 5962.686 |  |
| 262278900.0 | 5077.323 | 5936.507 |  |
| 262626750.0 | 5036.235 | 5910.443 |  |
| 262974600.0 | 4995.368 | 5884.492 |  |
| 263322450.0 | 4954.721 | 5858.655 |  |
| 263670300.0 | 4914.294 | 5832.931 |  |
| 264018150.0 | 4874.086 | 5807.32 |  |
| 264366000.0 | 4834.096 | 5781.82 |  |
| 264713850.0 | 4794.324 | 5756.432 |  |
| 265061700.0 | 4754.769 | 5731.155 |  |
| 265409550.0 | 4715.43 | 5705.988 |  |
| 265757400.0 | 4676.308 | 5680.931 |  |
| 266105250.0 | 4637.4 | 5655.984 |  |
| 266453100.0 | 4598.707 | 5631.146 |  |
| 266800950.0 | 4560.228 | 5606.417 |  |
| 267148800.0 | 4521.963 | 5581.795 |  |
| 267496650.0 | 4483.91 | 5557.282 |  |
| 267844500.0 | 4446.069 | 5532.875 |  |
| 268192350.0 | 4408.44 | 5508.575 |  |
| 268540200.0 | 4371.021 | 5484.382 |  |
| 268888050.0 | 4333.813 | 5460.294 |  |
| 269235900.0 | 4296.814 | 5436.311 |  |
| 269583750.0 | 4260.024 | 5412.434 |  |
| 269931600.0 | 4223.443 | 5388.66 |  |
| 270279450.0 | 4187.069 | 5364.991 |  |
| 270627300.0 | 4150.903 | 5341.425 |  |
| 270975150.0 | 4114.943 | 5317.962 |  |
| 271323000.0 | 4079.189 | 5294.602 |  |
| 271670850.0 | 4043.64 | 5271.344 |  |
| 272018700.0 | 4008.296 | 5248.187 |  |
| 272366550.0 | 3973.156 | 5225.132 |  |
| 272714400.0 | 3938.219 | 5202.178 |  |
| 273062250.0 | 3903.485 | 5179.324 |  |
| 273410100.0 | 3868.953 | 5156.569 |  |
| 273757950.0 | 3834.623 | 5133.915 |  |
| 274105800.0 | 3800.494 | 5111.359 |  |
| 274453650.0 | 3766.565 | 5088.902 |  |
| 274801500.0 | 3732.836 | 5066.543 |  |
| 275149350.0 | 3699.306 | 5044.282 |  |
| 275497200.0 | 3665.975 | 5022.118 |  |
| 275845050.0 | 3632.842 | 5000.051 |  |
| 276192900.0 | 3599.906 | 4978.081 |  |
| 276540750.0 | 3567.167 | 4956.207 |  |
| 276888600.0 | 3534.623 | 4934.428 |  |
| 277236450.0 | 3502.276 | 4912.744 |  |
| 277584300.0 | 3470.123 | 4891.156 |  |
| 277932150.0 | 3438.165 | 4869.661 |  |
| 278280000.0 | 3406.4 | 4848.261 |  |
| 278627850.0 | 3374.828 | 4826.954 |  |
| 278975700.0 | 3343.449 | 4805.741 |  |
| 279323550.0 | 3312.262 | 4784.62 |  |
| 279671400.0 | 3281.267 | 4763.591 |  |
| 280019250.0 | 3250.462 | 4742.654 |  |
| 280367100.0 | 3219.847 | 4721.809 |  |
| 280714950.0 | 3189.421 | 4701.055 |  |
| 281062800.0 | 3159.185 | 4680.392 |  |
| 281410650.0 | 3129.137 | 4659.819 |  |
| 281758500.0 | 3099.276 | 4639.336 |  |
| 282106350.0 | 3069.603 | 4618.943 |  |
| 282454200.0 | 3040.117 | 4598.639 |  |
| 282802050.0 | 3010.816 | 4578.423 |  |
| 283149900.0 | 2981.701 | 4558.296 |  |
| 283497750.0 | 2952.77 | 4538.257 |  |
| 283845600.0 | 2924.024 | 4518.305 |  |
| 284193450.0 | 2895.461 | 4498.441 |  |
| 284541300.0 | 2867.082 | 4478.664 |  |
| 284889150.0 | 2838.885 | 4458.973 |  |
| 285237000.0 | 2810.87 | 4439.368 |  |
| 285584850.0 | 2783.036 | 4419.849 |  |
| 285932700.0 | 2755.382 | 4400.415 |  |
| 286280550.0 | 2727.909 | 4381.066 |  |
| 286628400.0 | 2700.616 | 4361.801 |  |
| 286976250.0 | 2673.501 | 4342.621 |  |
| 287324100.0 | 2646.565 | 4323.525 |  |
| 287671950.0 | 2619.806 | 4304.512 |  |
| 288019800.0 | 2593.225 | 4285.583 |  |
| 288367650.0 | 2566.82 | 4266.736 |  |
| 288715500.0 | 2540.592 | 4247.971 |  |
| 289063350.0 | 2514.539 | 4229.289 |  |
| 289411200.0 | 2488.66 | 4210.688 |  |
| 289759050.0 | 2462.956 | 4192.169 |  |
| 290106900.0 | 2437.426 | 4173.73 |  |
| 290454750.0 | 2412.069 | 4155.373 |  |
| 290802600.0 | 2386.885 | 4137.095 |  |
| 291150450.0 | 2361.873 | 4118.897 |  |
| 291498300.0 | 2337.032 | 4100.779 |  |
| 291846150.0 | 2312.362 | 4082.74 |  |
| 292194000.0 | 2287.862 | 4064.78 |  |
| 292541850.0 | 2263.532 | 4046.899 |  |
| 292889700.0 | 2239.372 | 4029.095 |  |
| 293237550.0 | 2215.38 | 4011.37 |  |
| 293585400.0 | 2191.556 | 3993.722 |  |
| 293933250.0 | 2167.899 | 3976.151 |  |
| 294281100.0 | 2144.409 | 3958.657 |  |
| 294628950.0 | 2121.086 | 3941.239 |  |
| 294976800.0 | 2097.929 | 3923.898 |  |
| 295324650.0 | 2074.937 | 3906.632 |  |
| 295672500.0 | 2052.109 | 3889.442 |  |
| 296020350.0 | 2029.446 | 3872.327 |  |
| 296368200.0 | 2006.946 | 3855.287 |  |
| 296716050.0 | 1984.609 | 3838.321 |  |
| 297063900.0 | 1962.434 | 3821.429 |  |
| 297411750.0 | 1940.422 | 3804.612 |  |
| 297759600.0 | 1918.57 | 3787.868 |  |
| 298107450.0 | 1896.88 | 3771.197 |  |
| 298455300.0 | 1875.349 | 3754.599 |  |
| 298803150.0 | 1853.979 | 3738.073 |  |
| 299151000.0 | 1832.767 | 3721.62 |  |
| 299498850.0 | 1811.714 | 3705.239 |  |
| 299846700.0 | 1790.819 | 3688.929 |  |
| 300194550.0 | 1770.081 | 3672.691 |  |
| 300542400.0 | 1749.501 | 3656.523 |  |
| 300890250.0 | 1729.076 | 3640.426 |  |
| 301238100.0 | 1708.808 | 3624.4 |  |
| 301585950.0 | 1688.694 | 3608.444 |  |
| 301933800.0 | 1668.736 | 3592.557 |  |
| 302281650.0 | 1648.931 | 3576.74 |  |
| 302629500.0 | 1629.28 | 3560.992 |  |
| 302977350.0 | 1609.782 | 3545.313 |  |
| 303325200.0 | 1590.437 | 3529.703 |  |
| 303673050.0 | 1571.243 | 3514.161 |  |
| 304020900.0 | 1552.201 | 3498.686 |  |
| 304368750.0 | 1533.31 | 3483.28 |  |
| 304716600.0 | 1514.569 | 3467.94 |  |
| 305064450.0 | 1495.978 | 3452.668 |  |
| 305412300.0 | 1477.536 | 3437.462 |  |
| 305760150.0 | 1459.243 | 3422.323 |  |
| 306108000.0 | 1441.098 | 3407.251 |  |
| 306455850.0 | 1423.101 | 3392.244 |  |
| 306803700.0 | 1405.251 | 3377.302 |  |
| 307151550.0 | 1387.547 | 3362.426 |  |
| 307499400.0 | 1369.99 | 3347.615 |  |
| 307847250.0 | 1352.577 | 3332.869 |  |
| 308195100.0 | 1335.31 | 3318.187 |  |
| 308542950.0 | 1318.188 | 3303.57 |  |
| 308890800.0 | 1301.209 | 3289.016 |  |
| 309238650.0 | 1284.373 | 3274.526 |  |
| 309586500.0 | 1267.681 | 3260.1 |  |
| 309934350.0 | 1251.13 | 3245.736 |  |
| 310282200.0 | 1234.722 | 3231.435 |  |
| 310630050.0 | 1218.454 | 3217.197 |  |
| 310977900.0 | 1202.328 | 3203.021 |  |
| 311325750.0 | 1186.341 | 3188.907 |  |
| 311673600.0 | 1170.495 | 3174.854 |  |
| 312021450.0 | 1154.787 | 3160.863 |  |
| 312369300.0 | 1139.218 | 3146.934 |  |
| 312717150.0 | 1123.787 | 3133.065 |  |
| 313065000.0 | 1108.494 | 3119.257 |  |
| 313412850.0 | 1093.337 | 3105.509 |  |
| 313760700.0 | 1078.318 | 3091.821 |  |
| 314108550.0 | 1063.434 | 3078.193 |  |
| 314456400.0 | 1048.686 | 3064.625 |  |
| 314804250.0 | 1034.072 | 3051.116 |  |
| 315152100.0 | 1019.593 | 3037.666 |  |
| 315499950.0 | 1005.248 | 3024.275 |  |
| 315847800.0 | 991.037 | 3010.942 |  |
| 316195650.0 | 976.958 | 2997.668 |  |
| 316543500.0 | 963.012 | 2984.451 |  |
| 316891350.0 | 949.197 | 2971.293 |  |
| 317239200.0 | 935.514 | 2958.192 |  |
| 317587050.0 | 921.962 | 2945.148 |  |
| 317934900.0 | 908.54 | 2932.161 |  |
| 318282750.0 | 895.248 | 2919.232 |  |
| 318630600.0 | 882.085 | 2906.358 |  |
| 318978450.0 | 869.051 | 2893.541 |  |
| 319326300.0 | 856.145 | 2880.78 |  |
| 319674150.0 | 843.367 | 2868.075 |  |
| 320022000.0 | 830.717 | 2855.425 |  |
| 320369850.0 | 818.193 | 2842.831 |  |
| 320717700.0 | 805.795 | 2830.291 |  |
| 321065550.0 | 793.523 | 2817.807 |  |
| 321413400.0 | 781.376 | 2805.377 |  |
| 321761250.0 | 769.354 | 2793.001 |  |
| 322109100.0 | 757.457 | 2780.679 |  |
| 322456950.0 | 745.683 | 2768.412 |  |
| 322804800.0 | 734.032 | 2756.198 |  |
| 323152650.0 | 722.504 | 2744.037 |  |
| 323500500.0 | 711.098 | 2731.93 |  |
| 323848350.0 | 699.814 | 2719.875 |  |
| 324196200.0 | 688.652 | 2707.873 |  |
| 324544050.0 | 677.609 | 2695.924 |  |
| 324891900.0 | 666.688 | 2684.027 |  |
| 325239750.0 | 655.886 | 2672.182 |  |
| 325587600.0 | 645.203 | 2660.388 |  |
| 325935450.0 | 634.639 | 2648.647 |  |
| 326283300.0 | 624.193 | 2636.956 |  |
| 326631150.0 | 613.865 | 2625.317 |  |
| 326979000.0 | 603.654 | 2613.729 |  |
| 327326850.0 | 593.56 | 2602.191 |  |
| 327674700.0 | 583.583 | 2590.703 |  |
| 328022550.0 | 573.721 | 2579.266 |  |
| 328370400.0 | 563.975 | 2567.879 |  |
| 328718250.0 | 554.343 | 2556.542 |  |
| 329066100.0 | 544.826 | 2545.254 |  |
| 329413950.0 | 535.422 | 2534.016 |  |
| 329761800.0 | 526.132 | 2522.826 |  |
| 330109650.0 | 516.955 | 2511.686 |  |
| 330457500.0 | 507.89 | 2500.594 |  |
| 330805350.0 | 498.937 | 2489.551 |  |
| 331153200.0 | 490.096 | 2478.556 |  |
| 331501050.0 | 481.366 | 2467.61 |  |
| 331848900.0 | 472.746 | 2456.711 |  |
| 332196750.0 | 464.236 | 2445.859 |  |
| 332544600.0 | 455.835 | 2435.055 |  |
| 332892450.0 | 447.544 | 2424.299 |  |
| 333240300.0 | 439.361 | 2413.589 |  |
| 333588150.0 | 431.286 | 2402.926 |  |
| 333936000.0 | 423.319 | 2392.31 |  |
| 334283850.0 | 415.459 | 2381.74 |  |
| 334631700.0 | 407.706 | 2371.217 |  |
| 334979550.0 | 400.058 | 2360.739 |  |
| 335327400.0 | 392.517 | 2350.308 |  |
| 335675250.0 | 385.081 | 2339.921 |  |
| 336023100.0 | 377.749 | 2329.581 |  |
| 336370950.0 | 370.522 | 2319.285 |  |
| 336718800.0 | 363.399 | 2309.035 |  |
| 337066650.0 | 356.379 | 2298.829 |  |
| 337414500.0 | 349.462 | 2288.668 |  |
| 337762350.0 | 342.647 | 2278.551 |  |
| 338110200.0 | 335.934 | 2268.479 |  |
| 338458050.0 | 329.323 | 2258.45 |  |
| 338805900.0 | 322.813 | 2248.466 |  |
| 339153750.0 | 316.403 | 2238.525 |  |
| 339501600.0 | 310.094 | 2228.628 |  |
| 339849450.0 | 303.884 | 2218.773 |  |
| 340197300.0 | 297.773 | 2208.962 |  |
| 340545150.0 | 291.761 | 2199.194 |  |
| 340893000.0 | 285.847 | 2189.469 |  |
| 341240850.0 | 280.031 | 2179.786 |  |
| 341588700.0 | 274.312 | 2170.145 |  |
| 341936550.0 | 268.691 | 2160.546 |  |
| 342284400.0 | 263.165 | 2150.99 |  |
| 342632250.0 | 257.736 | 2141.475 |  |
| 342980100.0 | 252.402 | 2132.002 |  |
| 343327950.0 | 247.163 | 2122.57 |  |
| 343675800.0 | 242.019 | 2113.18 |  |
| 344023650.0 | 236.968 | 2103.83 |  |
| 344371500.0 | 232.012 | 2094.522 |  |
| 344719350.0 | 227.149 | 2085.254 |  |
| 345067200.0 | 222.378 | 2076.027 |  |
| 345415050.0 | 217.7 | 2066.84 |  |
| 345762900.0 | 213.114 | 2057.693 |  |
| 346110750.0 | 208.619 | 2048.586 |  |
| 346458600.0 | 204.215 | 2039.519 |  |
| 346806450.0 | 199.901 | 2030.491 |  |
| 347154300.0 | 195.678 | 2021.503 |  |
| 347502150.0 | 191.544 | 2012.555 |  |
| 347850000.0 | 187.5 | 2003.645 |  |
| 348197850.0 | 183.544 | 1994.775 |  |
| 348545700.0 | 179.677 | 1985.943 |  |
| 348893550.0 | 175.897 | 1977.15 |  |
| 349241400.0 | 172.205 | 1968.395 |  |
| 349589250.0 | 168.6 | 1959.678 |  |
| 349937100.0 | 165.082 | 1951 |  |
| 350284950.0 | 161.649 | 1942.36 |  |
| 350632800.0 | 158.302 | 1933.757 |  |
| 350980650.0 | 155.041 | 1925.192 |  |
| 351328500.0 | 151.864 | 1916.664 |  |
| 351676350.0 | 148.771 | 1908.174 |  |
| 352024200.0 | 145.763 | 1899.721 |  |
| 352372050.0 | 142.838 | 1891.305 |  |
| 352719900.0 | 139.996 | 1882.925 |  |
| 353067750.0 | 137.236 | 1874.582 |  |
| 353415600.0 | 134.559 | 1866.276 |  |
| 353763450.0 | 131.964 | 1858.006 |  |
| 354111300.0 | 129.449 | 1849.772 |  |
| 354459150.0 | 127.016 | 1841.574 |  |
| 354807000.0 | 124.663 | 1833.412 |  |
| 355154850.0 | 122.39 | 1825.286 |  |
| 355502700.0 | 120.197 | 1817.195 |  |
| 355850550.0 | 118.083 | 1809.14 |  |
| 356198400.0 | 116.048 | 1801.119 |  |
| 356546250.0 | 114.091 | 1793.134 |  |
| 356894100.0 | 112.212 | 1785.184 |  |
| 357241950.0 | 110.41 | 1777.268 |  |
| 357589800.0 | 108.685 | 1769.388 |  |
| 357937650.0 | 107.038 | 1761.541 |  |
| 358285500.0 | 105.466 | 1753.729 |  |
| 358633350.0 | 103.97 | 1745.951 |  |
| 358981200.0 | 102.549 | 1738.207 |  |
| 359329050.0 | 101.204 | 1730.497 |  |
| 359676900.0 | 99.932 | 1722.82 |  |
| 360024750.0 | 98.735 | 1715.178 |  |
| 360372600.0 | 97.612 | 1707.568 |  |
| 360720450.0 | 96.562 | 1699.992 |  |
| 361068300.0 | 95.585 | 1692.449 |  |
| 361416150.0 | 94.68 | 1684.939 |  |
| 361764000.0 | 93.847 | 1677.462 |  |
| 362111850.0 | 93.086 | 1670.017 |  |
| 362459700.0 | 92.396 | 1662.605 |  |
| 362807550.0 | 91.777 | 1655.225 |  |
| 363155400.0 | 91.228 | 1647.878 |  |
| 363503250.0 | 90.749 | 1640.563 |  |
| 363851100.0 | 90.34 | 1633.28 |  |
| 364198950.0 | 90 | 1626.028 |  |
| 364546800.0 | 89.728 | 1618.809 |  |
| 364894650.0 | 89.525 | 1611.62 |  |
| 365242500.0 | 89.39 | 1604.464 |  |
| 365590350.0 | 89.323 | 1597.338 |  |
| 365938200.0 | 89.322 | 1590.244 |  |
| 366286050.0 | 89.388 | 1583.181 |  |
| 366633900.0 | 89.521 | 1576.148 |  |
| 366981750.0 | 89.719 | 1569.147 |  |
| 367329600.0 | 89.983 | 1562.176 |  |
| 367677450.0 | 90.313 | 1555.235 |  |
| 368025300.0 | 90.706 | 1548.325 |  |
| 368373150.0 | 91.164 | 1541.445 |  |
| 368721000.0 | 91.686 | 1534.595 |  |
| 369068850.0 | 92.272 | 1527.775 |  |
| 369416700.0 | 92.921 | 1520.985 |  |
| 369764550.0 | 93.632 | 1514.225 |  |
| 370112400.0 | 94.406 | 1507.494 |  |
| 370460250.0 | 95.241 | 1500.792 |  |
| 370808100.0 | 96.138 | 1494.12 |  |
| 371155950.0 | 97.097 | 1487.477 |  |
| 371503800.0 | 98.116 | 1480.863 |  |
| 371851650.0 | 99.195 | 1474.278 |  |
| 372199500.0 | 100.334 | 1467.722 |  |
| 372547350.0 | 101.533 | 1461.194 |  |
| 372895200.0 | 102.791 | 1454.695 |  |
| 373243050.0 | 104.108 | 1448.224 |  |
| 373590900.0 | 105.484 | 1441.782 |  |
| 373938750.0 | 106.917 | 1435.368 |  |
| 374286600.0 | 108.408 | 1428.982 |  |
| 374634450.0 | 109.956 | 1422.623 |  |
| 374982300.0 | 111.561 | 1416.293 |  |
| 375330150.0 | 113.223 | 1409.99 |  |
| 375678000.0 | 114.941 | 1403.715 |  |
| 376025850.0 | 116.714 | 1397.467 |  |
| 376373700.0 | 118.543 | 1391.247 |  |
| 376721550.0 | 120.427 | 1385.053 |  |
| 377069400.0 | 122.365 | 1378.887 |  |
| 377417250.0 | 124.357 | 1372.748 |  |
| 377765100.0 | 126.404 | 1366.636 |  |
| 378112950.0 | 128.503 | 1360.55 |  |
| 378460800.0 | 130.656 | 1354.491 |  |
| 378808650.0 | 132.862 | 1348.458 |  |
| 379156500.0 | 135.12 | 1342.452 |  |
| 379504350.0 | 137.43 | 1336.472 |  |
| 379852200.0 | 139.791 | 1330.518 |  |
| 380200050.0 | 142.203 | 1324.591 |  |
| 380547900.0 | 144.667 | 1318.689 |  |
| 380895750.0 | 147.181 | 1312.813 |  |
| 381243600.0 | 149.745 | 1306.962 |  |
| 381591450.0 | 152.358 | 1301.138 |  |
| 381939300.0 | 155.021 | 1295.338 |  |
| 382287150.0 | 157.733 | 1289.564 |  |
| 382635000.0 | 160.494 | 1283.816 |  |
| 382982850.0 | 163.303 | 1278.092 |  |
| 383330700.0 | 166.159 | 1272.393 |  |
| 383678550.0 | 169.063 | 1266.72 |  |
| 384026400.0 | 172.015 | 1261.071 |  |
| 384374250.0 | 175.013 | 1255.447 |  |
| 384722100.0 | 178.057 | 1249.847 |  |
| 385069950.0 | 181.148 | 1244.272 |  |
| 385417800.0 | 184.284 | 1238.721 |  |
| 385765650.0 | 187.466 | 1233.195 |  |
| 386113500.0 | 190.693 | 1227.693 |  |
| 386461350.0 | 193.964 | 1222.214 |  |
| 386809200.0 | 197.279 | 1216.76 |  |
| 387157050.0 | 200.639 | 1211.33 |  |
| 387504900.0 | 204.042 | 1205.923 |  |
| 387852750.0 | 207.488 | 1200.54 |  |
| 388200600.0 | 210.977 | 1195.18 |  |
| 388548450.0 | 214.508 | 1189.844 |  |
| 388896300.0 | 218.082 | 1184.531 |  |
| 389244150.0 | 221.697 | 1179.242 |  |
| 389592000.0 | 225.354 | 1173.976 |  |
| 389939850.0 | 229.052 | 1168.732 |  |
| 390287700.0 | 232.791 | 1163.512 |  |
| 390635550.0 | 236.57 | 1158.314 |  |
| 390983400.0 | 240.389 | 1153.139 |  |
| 391331250.0 | 244.247 | 1147.987 |  |
| 391679100.0 | 248.145 | 1142.857 |  |
| 392026950.0 | 252.082 | 1137.75 |  |
| 392374800.0 | 256.058 | 1132.665 |  |
| 392722650.0 | 260.072 | 1127.602 |  |
| 393070500.0 | 264.124 | 1122.561 |  |
| 393418350.0 | 268.213 | 1117.543 |  |
| 393766200.0 | 272.34 | 1112.546 |  |
| 394114050.0 | 276.504 | 1107.571 |  |
| 394461900.0 | 280.704 | 1102.618 |  |
| 394809750.0 | 284.941 | 1097.687 |  |
| 395157600.0 | 289.213 | 1092.777 |  |
| 395505450.0 | 293.521 | 1087.888 |  |
| 395853300.0 | 297.864 | 1083.021 |  |
| 396201150.0 | 302.243 | 1078.176 |  |
| 396549000.0 | 306.655 | 1073.351 |  |
| 396896850.0 | 311.102 | 1068.548 |  |
| 397244700.0 | 315.583 | 1063.765 |  |
| 397592550.0 | 320.097 | 1059.003 |  |
| 397940400.0 | 324.645 | 1054.263 |  |
| 398288250.0 | 329.225 | 1049.543 |  |
| 398636100.0 | 333.838 | 1044.843 |  |
| 398983950.0 | 338.483 | 1040.164 |  |
| 399331800.0 | 343.16 | 1035.506 |  |
| 399679650.0 | 347.869 | 1030.868 |  |
| 400027500.0 | 352.609 | 1026.25 |  |
| 400375350.0 | 357.38 | 1021.653 |  |
| 400723200.0 | 362.181 | 1017.075 |  |
| 401071050.0 | 367.013 | 1012.518 |  |
| 401418900.0 | 371.874 | 1007.98 |  |
| 401766750.0 | 376.766 | 1003.463 |  |
| 402114600.0 | 381.686 | 998.965 |  |
| 402462450.0 | 386.635 | 994.486 |  |
| 402810300.0 | 391.614 | 990.028 |  |
| 403158150.0 | 396.62 | 985.589 |  |
| 403506000.0 | 401.654 | 981.169 |  |
| 403853850.0 | 406.716 | 976.768 |  |
| 404201700.0 | 411.806 | 972.387 |  |
| 404549550.0 | 416.922 | 968.025 |  |
| 404897400.0 | 422.065 | 963.682 |  |
| 405245250.0 | 427.235 | 959.358 |  |
| 405593100.0 | 432.43 | 955.053 |  |
| 405940950.0 | 437.652 | 950.767 |  |
| 406288800.0 | 442.899 | 946.499 |  |
| 406636650.0 | 448.171 | 942.25 |  |
| 406984500.0 | 453.468 | 938.02 |  |
| 407332350.0 | 458.789 | 933.808 |  |
| 407680200.0 | 464.135 | 929.615 |  |
| 408028050.0 | 469.504 | 925.439 |  |
| 408375900.0 | 474.897 | 921.283 |  |
| 408723750.0 | 480.313 | 917.144 |  |
| 409071600.0 | 485.753 | 913.023 |  |
| 409419450.0 | 491.215 | 908.921 |  |
| 409767300.0 | 496.699 | 904.836 |  |
| 410115150.0 | 502.205 | 900.769 |  |
| 410463000.0 | 507.734 | 896.721 |  |
| 410810850.0 | 513.283 | 892.689 |  |
| 411158700.0 | 518.854 | 888.676 |  |
| 411506550.0 | 524.445 | 884.679 |  |
| 411854400.0 | 530.057 | 880.701 |  |
| 412202250.0 | 535.69 | 876.74 |  |
| 412550100.0 | 541.342 | 872.796 |  |
| 412897950.0 | 547.014 | 868.869 |  |
| 413245800.0 | 552.705 | 864.96 |  |
| 413593650.0 | 558.415 | 861.067 |  |
| 413941500.0 | 564.144 | 857.192 |  |
| 414289350.0 | 569.892 | 853.333 |  |
| 414637200.0 | 575.657 | 849.492 |  |
| 414985050.0 | 581.441 | 845.667 |  |
| 415332900.0 | 587.242 | 841.859 |  |
| 415680750.0 | 593.06 | 838.067 |  |
| 416028600.0 | 598.895 | 834.292 |  |
| 416376450.0 | 604.747 | 830.534 |  |
| 416724300.0 | 610.615 | 826.792 |  |
| 417072150.0 | 616.5 | 823.067 |  |
| 417420000.0 | 622.4 | 819.357 |  |
| 417767850.0 | 628.316 | 815.664 |  |
| 418115700.0 | 634.247 | 811.987 |  |
| 418463550.0 | 640.193 | 808.327 |  |
| 418811400.0 | 646.153 | 804.682 |  |
| 419159250.0 | 652.128 | 801.053 |  |
| 419507100.0 | 658.117 | 797.44 |  |
| 419854950.0 | 664.12 | 793.843 |  |
| 420202800.0 | 670.136 | 790.261 |  |
| 420550650.0 | 676.166 | 786.695 |  |
| 420898500.0 | 682.208 | 783.145 |  |
| 421246350.0 | 688.263 | 779.61 |  |
| 421594200.0 | 694.331 | 776.091 |  |
| 421942050.0 | 700.411 | 772.587 |  |
| 422289900.0 | 706.502 | 769.098 |  |
| 422637750.0 | 712.605 | 765.625 |  |
| 422985600.0 | 718.72 | 762.167 |  |
| 423333450.0 | 724.845 | 758.724 |  |
| 423681300.0 | 730.981 | 755.296 |  |
| 424029150.0 | 737.128 | 751.883 |  |
| 424377000.0 | 743.285 | 748.485 |  |
| 424724850.0 | 749.451 | 745.102 |  |
| 425072700.0 | 755.628 | 741.733 |  |
| 425420550.0 | 761.813 | 738.38 |  |
| 425768400.0 | 768.008 | 735.041 |  |
| 426116250.0 | 774.212 | 731.716 |  |
| 426464100.0 | 780.424 | 728.406 |  |
| 426811950.0 | 786.645 | 725.111 |  |
| 427159800.0 | 792.873 | 721.83 |  |
| 427507650.0 | 799.109 | 718.563 |  |
| 427855500.0 | 805.353 | 715.311 |  |
| 428203350.0 | 811.604 | 712.073 |  |
| 428551200.0 | 817.862 | 708.849 |  |
| 428899050.0 | 824.126 | 705.639 |  |
| 429246900.0 | 830.397 | 702.443 |  |
| 429594750.0 | 836.675 | 699.261 |  |
| 429942600.0 | 842.958 | 696.093 |  |
| 430290450.0 | 849.246 | 692.939 |  |
| 430638300.0 | 855.54 | 689.798 |  |
| 430986150.0 | 861.84 | 686.672 |  |
| 431334000.0 | 868.144 | 683.559 |  |
| 431681850.0 | 874.453 | 680.459 |  |
| 432029700.0 | 880.766 | 677.373 |  |
| 432377550.0 | 887.083 | 674.301 |  |
| 432725400.0 | 893.404 | 671.242 |  |
| 433073250.0 | 899.728 | 668.197 |  |
| 433421100.0 | 906.056 | 665.165 |  |
| 433768950.0 | 912.387 | 662.146 |  |
| 434116800.0 | 918.721 | 659.14 |  |
| 434464650.0 | 925.058 | 656.147 |  |
| 434812500.0 | 931.396 | 653.168 |  |
| 435160350.0 | 937.737 | 650.201 |  |
| 435508200.0 | 944.08 | 647.248 |  |
| 435856050.0 | 950.424 | 644.307 |  |
| 436203900.0 | 956.77 | 641.379 |  |
| 436551750.0 | 963.117 | 638.464 |  |
| 436899600.0 | 969.464 | 635.562 |  |
| 437247450.0 | 975.812 | 632.673 |  |
| 437595300.0 | 982.161 | 629.796 |  |
| 437943150.0 | 988.509 | 626.931 |  |
| 438291000.0 | 994.858 | 624.08 |  |
| 438638850.0 | 1001.206 | 621.24 |  |
| 438986700.0 | 1007.553 | 618.413 |  |
| 439334550.0 | 1013.9 | 615.599 |  |
| 439682400.0 | 1020.245 | 612.797 |  |
| 440030250.0 | 1026.589 | 610.007 |  |
| 440378100.0 | 1032.932 | 607.229 |  |
| 440725950.0 | 1039.273 | 604.463 |  |
| 441073800.0 | 1045.611 | 601.71 |  |
| 441421650.0 | 1051.948 | 598.968 |  |
| 441769500.0 | 1058.282 | 596.238 |  |
| 442117350.0 | 1064.613 | 593.521 |  |
| 442465200.0 | 1070.941 | 590.815 |  |
| 442813050.0 | 1077.266 | 588.121 |  |
| 443160900.0 | 1083.587 | 585.439 |  |
| 443508750.0 | 1089.905 | 582.769 |  |
| 443856600.0 | 1096.219 | 580.11 |  |
| 444204450.0 | 1102.529 | 577.463 |  |
| 444552300.0 | 1108.834 | 574.827 |  |
| 444900150.0 | 1115.135 | 572.203 |  |
| 445248000.0 | 1121.431 | 569.591 |  |
| 445595850.0 | 1127.722 | 566.99 |  |
| 445943700.0 | 1134.008 | 564.4 |  |
| 446291550.0 | 1140.288 | 561.822 |  |
| 446639400.0 | 1146.562 | 559.254 |  |
| 446987250.0 | 1152.831 | 556.698 |  |
| 447335100.0 | 1159.093 | 554.154 |  |
| 447682950.0 | 1165.349 | 551.62 |  |
| 448030800.0 | 1171.598 | 549.098 |  |
| 448378650.0 | 1177.84 | 546.586 |  |
| 448726500.0 | 1184.076 | 544.085 |  |
| 449074350.0 | 1190.304 | 541.596 |  |
| 449422200.0 | 1196.524 | 539.117 |  |
| 449770050.0 | 1202.737 | 536.649 |  |
| 450117900.0 | 1208.942 | 534.192 |  |
| 450465750.0 | 1215.139 | 531.746 |  |
| 450813600.0 | 1221.328 | 529.31 |  |
| 451161450.0 | 1227.508 | 526.885 |  |
| 451509300.0 | 1233.679 | 524.471 |  |
| 451857150.0 | 1239.841 | 522.067 |  |
| 452205000.0 | 1245.994 | 519.674 |  |
| 452552850.0 | 1252.137 | 517.291 |  |
| 452900700.0 | 1258.271 | 514.918 |  |
| 453248550.0 | 1264.395 | 512.556 |  |
| 453596400.0 | 1270.509 | 510.204 |  |
| 453944250.0 | 1276.613 | 507.863 |  |
| 454292100.0 | 1282.706 | 505.532 |  |
| 454639950.0 | 1288.789 | 503.211 |  |
| 454987800.0 | 1294.861 | 500.9 |  |
| 455335650.0 | 1300.921 | 498.599 |  |
| 455683500.0 | 1306.971 | 496.308 |  |
| 456031350.0 | 1313.009 | 494.027 |  |
| 456379200.0 | 1319.035 | 491.757 |  |
| 456727050.0 | 1325.049 | 489.496 |  |
| 457074900.0 | 1331.051 | 487.245 |  |
| 457422750.0 | 1337.041 | 485.004 |  |
| 457770600.0 | 1343.019 | 482.772 |  |
| 458118450.0 | 1348.984 | 480.551 |  |
| 458466300.0 | 1354.935 | 478.339 |  |
| 458814150.0 | 1360.874 | 476.137 |  |
| 459162000.0 | 1366.8 | 473.944 |  |
| 459509850.0 | 1372.712 | 471.761 |  |
| 459857700.0 | 1378.61 | 469.588 |  |
| 460205550.0 | 1384.495 | 467.424 |  |
| 460553400.0 | 1390.365 | 465.27 |  |
| 460901250.0 | 1396.222 | 463.124 |  |
| 461249100.0 | 1402.063 | 460.989 |  |
| 461596950.0 | 1407.891 | 458.862 |  |
| 461944800.0 | 1413.703 | 456.745 |  |
| 462292650.0 | 1419.5 | 454.638 |  |
| 462640500.0 | 1425.283 | 452.539 |  |
| 462988350.0 | 1431.049 | 450.45 |  |
| 463336200.0 | 1436.801 | 448.37 |  |
| 463684050.0 | 1442.536 | 446.298 |  |
| 464031900.0 | 1448.256 | 444.236 |  |
| 464379750.0 | 1453.959 | 442.183 |  |
| 464727600.0 | 1459.646 | 440.139 |  |
| 465075450.0 | 1465.317 | 438.104 |  |
| 465423300.0 | 1470.971 | 436.078 |  |
| 465771150.0 | 1476.608 | 434.06 |  |
| 466119000.0 | 1482.228 | 432.052 |  |
| 466466850.0 | 1487.831 | 430.052 |  |
| 466814700.0 | 1493.416 | 428.061 |  |
| 467162550.0 | 1498.984 | 426.078 |  |
| 467510400.0 | 1504.534 | 424.105 |  |
| 467858250.0 | 1510.067 | 422.14 |  |
| 468206100.0 | 1515.581 | 420.183 |  |
| 468553950.0 | 1521.077 | 418.235 |  |
| 468901800.0 | 1526.554 | 416.296 |  |
| 469249650.0 | 1532.013 | 414.365 |  |
| 469597500.0 | 1537.453 | 412.442 |  |
| 469945350.0 | 1542.874 | 410.528 |  |
| 470293200.0 | 1548.276 | 408.623 |  |
| 470641050.0 | 1553.658 | 406.725 |  |
| 470988900.0 | 1559.021 | 404.836 |  |
| 471336750.0 | 1564.365 | 402.955 |  |
| 471684600.0 | 1569.688 | 401.083 |  |
| 472032450.0 | 1574.992 | 399.218 |  |
| 472380300.0 | 1580.276 | 397.362 |  |
| 472728150.0 | 1585.539 | 395.514 |  |
| 473076000.0 | 1590.781 | 393.674 |  |
| 473423850.0 | 1596.004 | 391.842 |  |
| 473771700.0 | 1601.205 | 390.018 |  |
| 474119550.0 | 1606.385 | 388.202 |  |
| 474467400.0 | 1611.544 | 386.394 |  |
| 474815250.0 | 1616.682 | 384.593 |  |
| 475163100.0 | 1621.799 | 382.801 |  |
| 475510950.0 | 1626.893 | 381.017 |  |
| 475858800.0 | 1631.966 | 379.24 |  |
| 476206650.0 | 1637.017 | 377.471 |  |
| 476554500.0 | 1642.046 | 375.71 |  |
| 476902350.0 | 1647.053 | 373.956 |  |
| 477250200.0 | 1652.038 | 372.21 |  |
| 477598050.0 | 1656.999 | 370.472 |  |
| 477945900.0 | 1661.939 | 368.742 |  |
| 478293750.0 | 1666.855 | 367.019 |  |
| 478641600.0 | 1671.748 | 365.303 |  |
| 478989450.0 | 1676.618 | 363.595 |  |
| 479337300.0 | 1681.465 | 361.895 |  |
| 479685150.0 | 1686.288 | 360.201 |  |
| 480033000.0 | 1691.088 | 358.516 |  |
| 480380850.0 | 1695.864 | 356.837 |  |
| 480728700.0 | 1700.616 | 355.166 |  |
| 481076550.0 | 1705.344 | 353.503 |  |
| 481424400.0 | 1710.048 | 351.846 |  |
| 481772250.0 | 1714.727 | 350.197 |  |
| 482120100.0 | 1719.382 | 348.555 |  |
| 482467950.0 | 1724.012 | 346.92 |  |
| 482815800.0 | 1728.618 | 345.293 |  |
| 483163650.0 | 1733.198 | 343.672 |  |
| 483511500.0 | 1737.754 | 342.059 |  |
| 483859350.0 | 1742.284 | 340.452 |  |
| 484207200.0 | 1746.789 | 338.853 |  |
| 484555050.0 | 1751.269 | 337.261 |  |
| 484902900.0 | 1755.723 | 335.675 |  |
| 485250750.0 | 1760.151 | 334.097 |  |
| 485598600.0 | 1764.553 | 332.525 |  |
| 485946450.0 | 1768.929 | 330.961 |  |
| 486294300.0 | 1773.279 | 329.403 |  |
| 486642150.0 | 1777.603 | 327.852 |  |
| 486990000.0 | 1781.9 | 326.307 |  |
| 487337850.0 | 1786.171 | 324.77 |  |
| 487685700.0 | 1790.415 | 323.239 |  |
| 488033550.0 | 1794.632 | 321.715 |  |
| 488381400.0 | 1798.822 | 320.198 |  |
| 488729250.0 | 1802.985 | 318.687 |  |
| 489077100.0 | 1807.121 | 317.183 |  |
| 489424950.0 | 1811.23 | 315.685 |  |
| 489772800.0 | 1815.311 | 314.194 |  |
| 490120650.0 | 1819.364 | 312.709 |  |
| 490468500.0 | 1823.39 | 311.231 |  |
| 490816350.0 | 1827.388 | 309.76 |  |
| 491164200.0 | 1831.357 | 308.295 |  |
| 491512050.0 | 1835.299 | 306.836 |  |
| 491859900.0 | 1839.213 | 305.383 |  |
| 492207750.0 | 1843.098 | 303.937 |  |
| 492555600.0 | 1846.955 | 302.498 |  |
| 492903450.0 | 1850.783 | 301.064 |  |
| 493251300.0 | 1854.582 | 299.637 |  |
| 493599150.0 | 1858.353 | 298.216 |  |
| 493947000.0 | 1862.094 | 296.801 |  |
| 494294850.0 | 1865.807 | 295.393 |  |
| 494642700.0 | 1869.49 | 293.991 |  |
| 494990550.0 | 1873.144 | 292.594 |  |
| 495338400.0 | 1876.769 | 291.204 |  |
| 495686250.0 | 1880.364 | 289.82 |  |
| 496034100.0 | 1883.93 | 288.442 |  |
| 496381950.0 | 1887.465 | 287.07 |  |
| 496729800.0 | 1890.971 | 285.704 |  |
| 497077650.0 | 1894.447 | 284.344 |  |
| 497425500.0 | 1897.893 | 282.99 |  |
| 497773350.0 | 1901.309 | 281.642 |  |
| 498121200.0 | 1904.694 | 280.3 |  |
| 498469050.0 | 1908.049 | 278.963 |  |
| 498816900.0 | 1911.373 | 277.633 |  |
| 499164750.0 | 1914.667 | 276.308 |  |
| 499512600.0 | 1917.93 | 274.989 |  |
| 499860450.0 | 1921.162 | 273.676 |  |
| 500208300.0 | 1924.363 | 272.369 |  |
| 500556150.0 | 1927.534 | 271.067 |  |
| 500904000.0 | 1930.673 | 269.771 |  |
| 501251850.0 | 1933.78 | 268.481 |  |
| 501599700.0 | 1936.857 | 267.196 |  |
| 501947550.0 | 1939.902 | 265.917 |  |
| 502295400.0 | 1942.915 | 264.643 |  |
| 502643250.0 | 1945.897 | 263.375 |  |
| 502991100.0 | 1948.847 | 262.113 |  |
| 503338950.0 | 1951.765 | 260.856 |  |
| 503686800.0 | 1954.651 | 259.605 |  |
| 504034650.0 | 1957.506 | 258.359 |  |
| 504382500.0 | 1960.328 | 257.118 |  |
| 504730350.0 | 1963.118 | 255.883 |  |
| 505078200.0 | 1965.875 | 254.654 |  |
| 505426050.0 | 1968.6 | 253.429 |  |
| 505773900.0 | 1971.293 | 252.211 |  |
| 506121750.0 | 1973.953 | 250.997 |  |
| 506469600.0 | 1976.58 | 249.789 |  |
| 506817450.0 | 1979.175 | 248.586 |  |
| 507165300.0 | 1981.736 | 247.388 |  |
| 507513150.0 | 1984.265 | 246.196 |  |
| 507861000.0 | 1986.761 | 245.008 |  |
| 508208850.0 | 1989.223 | 243.826 |  |
| 508556700.0 | 1991.653 | 242.649 |  |
| 508904550.0 | 1994.049 | 241.477 |  |
| 509252400.0 | 1996.411 | 240.311 |  |
| 509600250.0 | 1998.741 | 239.149 |  |
| 509948100.0 | 2001.036 | 237.993 |  |
| 510295950.0 | 2003.298 | 236.841 |  |
| 510643800.0 | 2005.527 | 235.695 |  |
| 510991650.0 | 2007.721 | 234.554 |  |
| 511339500.0 | 2009.882 | 233.417 |  |
| 511687350.0 | 2012.009 | 232.286 |  |
| 512035200.0 | 2014.101 | 231.159 |  |
| 512383050.0 | 2016.16 | 230.038 |  |
| 512730900.0 | 2018.185 | 228.921 |  |
| 513078750.0 | 2020.175 | 227.809 |  |
| 513426600.0 | 2022.131 | 226.703 |  |
| 513774450.0 | 2024.052 | 225.6 |  |
| 514122300.0 | 2025.939 | 224.503 |  |
| 514470150.0 | 2027.792 | 223.411 |  |
| 514818000.0 | 2029.609 | 222.323 |  |
| 515165850.0 | 2031.393 | 221.24 |  |
| 515513700.0 | 2033.141 | 220.162 |  |
| 515861550.0 | 2034.855 | 219.089 |  |
| 516209400.0 | 2036.533 | 218.02 |  |
| 516557250.0 | 2038.177 | 216.956 |  |
| 516905100.0 | 2039.786 | 215.896 |  |
| 517252950.0 | 2041.359 | 214.841 |  |
| 517600800.0 | 2042.898 | 213.791 |  |
| 517948650.0 | 2044.401 | 212.746 |  |
| 518296500.0 | 2045.869 | 211.705 |  |
| 518644350.0 | 2047.301 | 210.668 |  |
| 518992200.0 | 2048.699 | 209.636 |  |
| 519340050.0 | 2050.06 | 208.609 |  |
| 519687900.0 | 2051.386 | 207.586 |  |
| 520035750.0 | 2052.677 | 206.567 |  |
| 520383600.0 | 2053.932 | 205.553 |  |
| 520731450.0 | 2055.151 | 204.544 |  |
| 521079300.0 | 2056.334 | 203.538 |  |
| 521427150.0 | 2057.482 | 202.538 |  |
| 521775000.0 | 2058.594 | 201.541 |  |
| 522122850.0 | 2059.67 | 200.549 |  |
| 522470700.0 | 2060.709 | 199.561 |  |
| 522818550.0 | 2061.713 | 198.578 |  |
| 523166400.0 | 2062.681 | 197.599 |  |
| 523514250.0 | 2063.612 | 196.624 |  |
| 523862100.0 | 2064.507 | 195.654 |  |
| 524209950.0 | 2065.366 | 194.687 |  |
| 524557800.0 | 2066.189 | 193.725 |  |
| 524905650.0 | 2066.976 | 192.767 |  |
| 525253500.0 | 2067.726 | 191.814 |  |
| 525601350.0 | 2068.439 | 190.864 |  |
| 525949200.0 | 2069.116 | 189.919 |  |
| 526297050.0 | 2069.757 | 188.977 |  |
| 526644900.0 | 2070.361 | 188.04 |  |
| 526992750.0 | 2070.928 | 187.107 |  |
| 527340600.0 | 2071.458 | 186.178 |  |
| 527688450.0 | 2071.952 | 185.253 |  |
| 528036300.0 | 2072.41 | 184.333 |  |
| 528384150.0 | 2072.83 | 183.416 |  |
| 528732000.0 | 2073.213 | 182.503 |  |
| 529079850.0 | 2073.56 | 181.594 |  |
| 529427700.0 | 2073.87 | 180.689 |  |
| 529775550.0 | 2074.143 | 179.788 |  |
| 530123400.0 | 2074.378 | 178.891 |  |
| 530471250.0 | 2074.577 | 177.998 |  |
| 530819100.0 | 2074.739 | 177.109 |  |
| 531166950.0 | 2074.863 | 176.224 |  |
| 531514800.0 | 2074.951 | 175.343 |  |
| 531862650.0 | 2075.001 | 174.465 |  |
| 532210500.0 | 2075.014 | 173.591 |  |
| 532558350.0 | 2074.99 | 172.722 |  |
| 532906200.0 | 2074.929 | 171.856 |  |
| 533254050.0 | 2074.83 | 170.993 |  |
| 533601900.0 | 2074.694 | 170.135 |  |
| 533949750.0 | 2074.521 | 169.28 |  |
| 534297600.0 | 2074.31 | 168.429 |  |
| 534645450.0 | 2074.062 | 167.582 |  |
| 534993300.0 | 2073.776 | 166.738 |  |
| 535341150.0 | 2073.453 | 165.898 |  |
| 535689000.0 | 2073.093 | 165.062 |  |
| 536036850.0 | 2072.695 | 164.229 |  |
| 536384700.0 | 2072.259 | 163.4 |  |
| 536732550.0 | 2071.786 | 162.575 |  |
| 537080400.0 | 2071.276 | 161.753 |  |
| 537428250.0 | 2070.727 | 160.935 |  |
| 537776100.0 | 2070.141 | 160.121 |  |
| 538123950.0 | 2069.518 | 159.31 |  |
| 538471800.0 | 2068.857 | 158.502 |  |
| 538819650.0 | 2068.158 | 157.699 |  |
| 539167500.0 | 2067.421 | 156.898 |  |
| 539515350.0 | 2066.647 | 156.101 |  |
| 539863200.0 | 2065.835 | 155.308 |  |
| 540211050.0 | 2064.986 | 154.518 |  |
| 540558900.0 | 2064.098 | 153.731 |  |
| 540906750.0 | 2063.173 | 152.948 |  |
| 541254600.0 | 2062.21 | 152.169 |  |
| 541602450.0 | 2061.21 | 151.393 |  |
| 541950300.0 | 2060.171 | 150.62 |  |
| 542298150.0 | 2059.095 | 149.85 |  |
| 542646000.0 | 2057.981 | 149.084 |  |
| 542993850.0 | 2056.829 | 148.322 |  |
| 543341700.0 | 2055.639 | 147.562 |  |
| 543689550.0 | 2054.411 | 146.806 |  |
| 544037400.0 | 2053.146 | 146.053 |  |
| 544385250.0 | 2051.843 | 145.304 |  |
| 544733100.0 | 2050.501 | 144.558 |  |
| 545080950.0 | 2049.122 | 143.815 |  |
| 545428800.0 | 2047.706 | 143.075 |  |
| 545776650.0 | 2046.251 | 142.339 |  |
| 546124500.0 | 2044.758 | 141.605 |  |
| 546472350.0 | 2043.228 | 140.875 |  |
| 546820200.0 | 2041.66 | 140.149 |  |
| 547168050.0 | 2040.053 | 139.425 |  |
| 547515900.0 | 2038.409 | 138.704 |  |
| 547863750.0 | 2036.728 | 137.987 |  |
| 548211600.0 | 2035.008 | 137.273 |  |
| 548559450.0 | 2033.25 | 136.562 |  |
| 548907300.0 | 2031.455 | 135.854 |  |
| 549255150.0 | 2029.621 | 135.149 |  |
| 549603000.0 | 2027.75 | 134.447 |  |
| 549950850.0 | 2025.841 | 133.748 |  |
| 550298700.0 | 2023.895 | 133.053 |  |
| 550646550.0 | 2021.91 | 132.36 |  |
| 550994400.0 | 2019.888 | 131.67 |  |
| 551342250.0 | 2017.828 | 130.984 |  |
| 551690100.0 | 2015.73 | 130.3 |  |
| 552037950.0 | 2013.594 | 129.62 |  |
| 552385800.0 | 2011.421 | 128.942 |  |
| 552733650.0 | 2009.209 | 128.267 |  |
| 553081500.0 | 2006.96 | 127.596 |  |
| 553429350.0 | 2004.674 | 126.927 |  |
| 553777200.0 | 2002.35 | 126.261 |  |
| 554125050.0 | 1999.988 | 125.598 |  |
| 554472900.0 | 1997.588 | 124.938 |  |
| 554820750.0 | 1995.151 | 124.281 |  |
| 555168600.0 | 1992.676 | 123.627 |  |
| 555516450.0 | 1990.163 | 122.975 |  |
| 555864300.0 | 1987.613 | 122.327 |  |
| 556212150.0 | 1985.025 | 121.681 |  |
| 556560000.0 | 1982.4 | 121.038 |  |
| 556907850.0 | 1979.737 | 120.398 |  |
| 557255700.0 | 1977.037 | 119.76 |  |
| 557603550.0 | 1974.299 | 119.126 |  |
| 557951400.0 | 1971.524 | 118.494 |  |
| 558299250.0 | 1968.712 | 117.865 |  |
| 558647100.0 | 1965.862 | 117.239 |  |
| 558994950.0 | 1962.974 | 116.616 |  |
| 559342800.0 | 1960.049 | 115.995 |  |
| 559690650.0 | 1957.087 | 115.377 |  |
| 560038500.0 | 1954.088 | 114.761 |  |
| 560386350.0 | 1951.052 | 114.149 |  |
| 560734200.0 | 1947.978 | 113.539 |  |
| 561082050.0 | 1944.867 | 112.931 |  |
| 561429900.0 | 1941.719 | 112.327 |  |
| 561777750.0 | 1938.534 | 111.725 |  |
| 562125600.0 | 1935.311 | 111.125 |  |
| 562473450.0 | 1932.052 | 110.528 |  |
| 562821300.0 | 1928.756 | 109.934 |  |
| 563169150.0 | 1925.422 | 109.343 |  |
| 563517000.0 | 1922.052 | 108.754 |  |
| 563864850.0 | 1918.645 | 108.167 |  |
| 564212700.0 | 1915.201 | 107.584 |  |
| 564560550.0 | 1911.72 | 107.002 |  |
| 564908400.0 | 1908.202 | 106.424 |  |
| 565256250.0 | 1904.648 | 105.847 |  |
| 565604100.0 | 1901.057 | 105.274 |  |
| 565951950.0 | 1897.429 | 104.702 |  |
| 566299800.0 | 1893.765 | 104.134 |  |
| 566647650.0 | 1890.064 | 103.568 |  |
| 566995500.0 | 1886.326 | 103.004 |  |
| 567343350.0 | 1882.552 | 102.443 |  |
| 567691200.0 | 1878.742 | 101.884 |  |
| 568039050.0 | 1874.895 | 101.327 |  |
| 568386900.0 | 1871.012 | 100.773 |  |
| 568734750.0 | 1867.093 | 100.222 |  |
| 569082600.0 | 1863.137 | 99.673 |  |
| 569430450.0 | 1859.145 | 99.126 |  |
| 569778300.0 | 1855.117 | 98.582 |  |
| 570126150.0 | 1851.053 | 98.04 |  |
| 570474000.0 | 1846.953 | 97.5 |  |
| 570821850.0 | 1842.817 | 96.963 |  |
| 571169700.0 | 1838.646 | 96.428 |  |
| 571517550.0 | 1834.438 | 95.896 |  |
| 571865400.0 | 1830.194 | 95.366 |  |
| 572213250.0 | 1825.915 | 94.838 |  |
| 572561100.0 | 1821.6 | 94.312 |  |
| 572908950.0 | 1817.249 | 93.789 |  |
| 573256800.0 | 1812.863 | 93.268 |  |
| 573604650.0 | 1808.441 | 92.749 |  |
| 573952500.0 | 1803.984 | 92.233 |  |
| 574300350.0 | 1799.491 | 91.719 |  |
| 574648200.0 | 1794.963 | 91.207 |  |
| 574996050.0 | 1790.4 | 90.697 |  |
| 575343900.0 | 1785.802 | 90.189 |  |
| 575691750.0 | 1781.168 | 89.684 |  |
| 576039600.0 | 1776.5 | 89.181 |  |
| 576387450.0 | 1771.796 | 88.68 |  |
| 576735300.0 | 1767.058 | 88.182 |  |
| 577083150.0 | 1762.284 | 87.685 |  |
| 577431000.0 | 1757.476 | 87.191 |  |
| 577778850.0 | 1752.633 | 86.699 |  |
| 578126700.0 | 1747.755 | 86.209 |  |
| 578474550.0 | 1742.843 | 85.721 |  |
| 578822400.0 | 1737.897 | 85.235 |  |
| 579170250.0 | 1732.915 | 84.752 |  |
| 579518100.0 | 1727.9 | 84.27 |  |
| 579865950.0 | 1722.85 | 83.791 |  |
| 580213800.0 | 1717.766 | 83.314 |  |
| 580561650.0 | 1712.648 | 82.838 |  |
| 580909500.0 | 1707.495 | 82.365 |  |
| 581257350.0 | 1702.309 | 81.894 |  |
| 581605200.0 | 1697.089 | 81.425 |  |
| 581953050.0 | 1691.835 | 80.958 |  |
| 582300900.0 | 1686.547 | 80.493 |  |
| 582648750.0 | 1681.226 | 80.031 |  |
| 582996600.0 | 1675.87 | 79.57 |  |
| 583344450.0 | 1670.482 | 79.111 |  |
| 583692300.0 | 1665.06 | 78.654 |  |
| 584040150.0 | 1659.604 | 78.199 |  |
| 584388000.0 | 1654.116 | 77.747 |  |
| 584735850.0 | 1648.594 | 77.296 |  |
| 585083700.0 | 1643.039 | 76.847 |  |
| 585431550.0 | 1637.451 | 76.4 |  |
| 585779400.0 | 1631.83 | 75.955 |  |
| 586127250.0 | 1626.177 | 75.512 |  |
| 586475100.0 | 1620.49 | 75.071 |  |
| 586822950.0 | 1614.771 | 74.632 |  |
| 587170800.0 | 1609.019 | 74.194 |  |
| 587518650.0 | 1603.235 | 73.759 |  |
| 587866500.0 | 1597.419 | 73.326 |  |
| 588214350.0 | 1591.57 | 72.894 |  |
| 588562200.0 | 1585.689 | 72.465 |  |
| 588910050.0 | 1579.776 | 72.037 |  |
| 589257900.0 | 1573.831 | 71.611 |  |
| 589605750.0 | 1567.854 | 71.187 |  |
| 589953600.0 | 1561.845 | 70.765 |  |
| 590301450.0 | 1555.805 | 70.344 |  |
| 590649300.0 | 1549.732 | 69.926 |  |
| 590997150.0 | 1543.629 | 69.509 |  |
| 591345000.0 | 1537.494 | 69.094 |  |
| 591692850.0 | 1531.327 | 68.681 |  |
| 592040700.0 | 1525.13 | 68.27 |  |
| 592388550.0 | 1518.901 | 67.861 |  |
| 592736400.0 | 1512.641 | 67.453 |  |
| 593084250.0 | 1506.351 | 67.047 |  |
| 593432100.0 | 1500.029 | 66.643 |  |
| 593779950.0 | 1493.677 | 66.241 |  |
| 594127800.0 | 1487.294 | 65.84 |  |
| 594475650.0 | 1480.881 | 65.442 |  |
| 594823500.0 | 1474.438 | 65.045 |  |
| 595171350.0 | 1467.964 | 64.649 |  |
| 595519200.0 | 1461.46 | 64.256 |  |
| 595867050.0 | 1454.926 | 63.864 |  |
| 596214900.0 | 1448.362 | 63.474 |  |
| 596562750.0 | 1441.768 | 63.085 |  |
| 596910600.0 | 1435.144 | 62.699 |  |
| 597258450.0 | 1428.491 | 62.313 |  |
| 597606300.0 | 1421.808 | 61.93 |  |
| 597954150.0 | 1415.096 | 61.548 |  |
| 598302000.0 | 1408.355 | 61.168 |  |
| 598649850.0 | 1401.585 | 60.79 |  |
| 598997700.0 | 1394.785 | 60.413 |  |
| 599345550.0 | 1387.957 | 60.038 |  |
| 599693400.0 | 1381.1 | 59.665 |  |
| 600041250.0 | 1374.214 | 59.293 |  |
| 600389100.0 | 1367.299 | 58.923 |  |
| 600736950.0 | 1360.357 | 58.554 |  |
| 601084800.0 | 1353.386 | 58.187 |  |
| 601432650.0 | 1346.386 | 57.822 |  |
| 601780500.0 | 1339.359 | 57.458 |  |
| 602128350.0 | 1332.304 | 57.096 |  |
| 602476200.0 | 1325.221 | 56.736 |  |
| 602824050.0 | 1318.11 | 56.377 |  |
| 603171900.0 | 1310.971 | 56.019 |  |
| 603519750.0 | 1303.806 | 55.663 |  |
| 603867600.0 | 1296.612 | 55.309 |  |
| 604215450.0 | 1289.392 | 54.956 |  |
| 604563300.0 | 1282.145 | 54.605 |  |
| 604911150.0 | 1274.871 | 54.255 |  |
| 605259000.0 | 1267.57 | 53.907 |  |
| 605606850.0 | 1260.242 | 53.561 |  |
| 605954700.0 | 1252.888 | 53.215 |  |
| 606302550.0 | 1245.507 | 52.872 |  |
| 606650400.0 | 1238.1 | 52.53 |  |
| 606998250.0 | 1230.667 | 52.189 |  |
| 607346100.0 | 1223.208 | 51.85 |  |
| 607693950.0 | 1215.723 | 51.512 |  |
| 608041800.0 | 1208.213 | 51.176 |  |
| 608389650.0 | 1200.677 | 50.842 |  |
| 608737500.0 | 1193.115 | 50.508 |  |
| 609085350.0 | 1185.528 | 50.177 |  |
| 609433200.0 | 1177.916 | 49.846 |  |
| 609781050.0 | 1170.279 | 49.517 |  |
| 610128900.0 | 1162.617 | 49.19 |  |
| 610476750.0 | 1154.931 | 48.864 |  |
| 610824600.0 | 1147.22 | 48.539 |  |
| 611172450.0 | 1139.484 | 48.216 |  |
| 611520300.0 | 1131.724 | 47.895 |  |
| 611868150.0 | 1123.94 | 47.574 |  |
| 612216000.0 | 1116.132 | 47.255 |  |
| 612563850.0 | 1108.3 | 46.938 |  |
| 612911700.0 | 1100.444 | 46.622 |  |
| 613259550.0 | 1092.565 | 46.307 |  |
| 613607400.0 | 1084.662 | 45.993 |  |
| 613955250.0 | 1076.736 | 45.681 |  |
| 614303100.0 | 1068.787 | 45.371 |  |
| 614650950.0 | 1060.815 | 45.061 |  |
| 614998800.0 | 1052.821 | 44.753 |  |
| 615346650.0 | 1044.803 | 44.447 |  |
| 615694500.0 | 1036.763 | 44.142 |  |
| 616042350.0 | 1028.701 | 43.838 |  |
| 616390200.0 | 1020.616 | 43.535 |  |
| 616738050.0 | 1012.51 | 43.234 |  |
| 617085900.0 | 1004.382 | 42.934 |  |
| 617433750.0 | 996.231 | 42.635 |  |
| 617781600.0 | 988.06 | 42.338 |  |
| 618129450.0 | 979.867 | 42.042 |  |
| 618477300.0 | 971.652 | 41.747 |  |
| 618825150.0 | 963.417 | 41.454 |  |
| 619173000.0 | 955.161 | 41.161 |  |
| 619520850.0 | 946.884 | 40.871 |  |
| 619868700.0 | 938.586 | 40.581 |  |
| 620216550.0 | 930.268 | 40.293 |  |
| 620564400.0 | 921.93 | 40.005 |  |
| 620912250.0 | 913.571 | 39.72 |  |
| 621260100.0 | 905.193 | 39.435 |  |
| 621607950.0 | 896.795 | 39.152 |  |
| 621955800.0 | 888.377 | 38.87 |  |
| 622303650.0 | 879.94 | 38.589 |  |
| 622651500.0 | 871.484 | 38.309 |  |
| 622999350.0 | 863.009 | 38.031 |  |
| 623347200.0 | 854.514 | 37.753 |  |
| 623695050.0 | 846.001 | 37.477 |  |
| 624042900.0 | 837.47 | 37.203 |  |
| 624390750.0 | 828.92 | 36.929 |  |
| 624738600.0 | 820.351 | 36.657 |  |
| 625086450.0 | 811.765 | 36.385 |  |
| 625434300.0 | 803.161 | 36.115 |  |
| 625782150.0 | 794.539 | 35.847 |  |
| 626130000.0 | 785.9 | 35.579 |  |
| 626477850.0 | 777.243 | 35.312 |  |
| 626825700.0 | 768.57 | 35.047 |  |
| 627173550.0 | 759.879 | 34.783 |  |
| 627521400.0 | 751.171 | 34.52 |  |
| 627869250.0 | 742.447 | 34.258 |  |
| 628217100.0 | 733.707 | 33.997 |  |
| 628564950.0 | 724.95 | 33.738 |  |
| 628912800.0 | 716.177 | 33.479 |  |
| 629260650.0 | 707.388 | 33.222 |  |
| 629608500.0 | 698.584 | 32.966 |  |
| 629956350.0 | 689.764 | 32.711 |  |
| 630304200.0 | 680.928 | 32.457 |  |
| 630652050.0 | 672.078 | 32.204 |  |
| 630999900.0 | 663.213 | 31.952 |  |
| 631347750.0 | 654.333 | 31.701 |  |
| 631695600.0 | 645.438 | 31.452 |  |
| 632043450.0 | 636.529 | 31.203 |  |
| 632391300.0 | 627.606 | 30.956 |  |
| 632739150.0 | 618.669 | 30.71 |  |
| 633087000.0 | 609.718 | 30.465 |  |
| 633434850.0 | 600.753 | 30.221 |  |
| 633782700.0 | 591.775 | 29.977 |  |
| 634130550.0 | 582.784 | 29.735 |  |
| 634478400.0 | 573.78 | 29.494 |  |
| 634826250.0 | 564.763 | 29.255 |  |
| 635174100.0 | 555.733 | 29.016 |  |
| 635521950.0 | 546.691 | 28.778 |  |
| 635869800.0 | 537.637 | 28.541 |  |
| 636217650.0 | 528.57 | 28.305 |  |
| 636565500.0 | 519.492 | 28.071 |  |
| 636913350.0 | 510.403 | 27.837 |  |
| 637261200.0 | 501.302 | 27.604 |  |
| 637609050.0 | 492.189 | 27.373 |  |
| 637956900.0 | 483.066 | 27.142 |  |
| 638304750.0 | 473.932 | 26.913 |  |
| 638652600.0 | 464.787 | 26.684 |  |
| 639000450.0 | 455.632 | 26.456 |  |
| 639348300.0 | 446.467 | 26.23 |  |
| 639696150.0 | 437.291 | 26.004 |  |
| 640044000.0 | 428.106 | 25.78 |  |
| 640391850.0 | 418.912 | 25.556 |  |
| 640739700.0 | 409.708 | 25.333 |  |
| 641087550.0 | 400.495 | 25.111 |  |
| 641435400.0 | 391.273 | 24.891 |  |
| 641783250.0 | 382.042 | 24.671 |  |
| 642131100.0 | 372.803 | 24.452 |  |
| 642478950.0 | 363.555 | 24.234 |  |
| 642826800.0 | 354.3 | 24.017 |  |
| 643174650.0 | 345.036 | 23.801 |  |
| 643522500.0 | 335.765 | 23.586 |  |
| 643870350.0 | 326.487 | 23.372 |  |
| 644218200.0 | 317.201 | 23.159 |  |
| 644566050.0 | 307.908 | 22.947 |  |
| 644913900.0 | 298.609 | 22.736 |  |
| 645261750.0 | 289.303 | 22.525 |  |
| 645609600.0 | 279.991 | 22.316 |  |
| 645957450.0 | 270.673 | 22.108 |  |
| 646305300.0 | 261.348 | 21.9 |  |
| 646653150.0 | 252.018 | 21.693 |  |
| 647001000.0 | 242.683 | 21.487 |  |
| 647348850.0 | 233.343 | 21.283 |  |
| 647696700.0 | 223.997 | 21.079 |  |
| 648044550.0 | 214.647 | 20.875 |  |
| 648392400.0 | 205.292 | 20.673 |  |
| 648740250.0 | 195.933 | 20.472 |  |
| 649088100.0 | 186.57 | 20.271 |  |
| 649435950.0 | 177.203 | 20.072 |  |
| 649783800.0 | 167.833 | 19.873 |  |
| 650131650.0 | 158.459 | 19.675 |  |
| 650479500.0 | 149.082 | 19.478 |  |
| 650827350.0 | 139.702 | 19.282 |  |
| 651175200.0 | 130.319 | 19.087 |  |
| 651523050.0 | 120.934 | 18.893 |  |
| 651870900.0 | 111.547 | 18.699 |  |
| 652218750.0 | 102.158 | 18.506 |  |
| 652566600.0 | 92.767 | 18.315 |  |
| 652914450.0 | 83.374 | 18.124 |  |
| 653262300.0 | 73.98 | 17.933 |  |
| 653610150.0 | 64.586 | 17.744 |  |
| 653958000.0 | 55.19 | 17.556 |  |
| 654305850.0 | 45.794 | 17.368 |  |
| 654653700.0 | 36.398 | 17.181 |  |
| 655001550.0 | 27.001 | 16.995 |  |
| 655349400.0 | 17.605 | 16.81 |  |
| 655697250.0 | 8.21 | 16.625 |  |
| 656045100.0 | -1.186 | 16.442 |  |
| 656392950.0 | -10.58 | 16.259 |  |
| 656740800.0 | -19.973 | 16.077 |  |
| 657088650.0 | -29.364 | 15.895 |  |
| 657436500.0 | -38.754 | 15.715 |  |
| 657784350.0 | -48.142 | 15.535 |  |
| 658132200.0 | -57.528 | 15.357 |  |
| 658480050.0 | -66.911 | 15.178 |  |
| 658827900.0 | -76.292 | 15.001 |  |
| 659175750.0 | -85.67 | 14.825 |  |
| 659523600.0 | -95.044 | 14.649 |  |
| 659871450.0 | -104.416 | 14.474 |  |
| 660219300.0 | -113.783 | 14.3 |  |
| 660567150.0 | -123.147 | 14.126 |  |
| 660915000.0 | -132.506 | 13.953 |  |
| 661262850.0 | -141.861 | 13.781 |  |
| 661610700.0 | -151.212 | 13.61 |  |
| 661958550.0 | -160.557 | 13.44 |  |
| 662306400.0 | -169.897 | 13.27 |  |
| 662654250.0 | -179.232 | 13.101 |  |
| 663002100.0 | -188.561 | 12.933 |  |
| 663349950.0 | -197.883 | 12.765 |  |
| 663697800.0 | -207.2 | 12.599 |  |
| 664045650.0 | -216.51 | 12.433 |  |
| 664393500.0 | -225.814 | 12.267 |  |
| 664741350.0 | -235.11 | 12.103 |  |
| 665089200.0 | -244.399 | 11.939 |  |
| 665437050.0 | -253.68 | 11.776 |  |
| 665784900.0 | -262.954 | 11.613 |  |
| 666132750.0 | -272.219 | 11.452 |  |
| 666480600.0 | -281.476 | 11.291 |  |
| 666828450.0 | -290.725 | 11.13 |  |
| 667176300.0 | -299.964 | 10.971 |  |
| 667524150.0 | -309.195 | 10.812 |  |
| 667872000.0 | -318.415 | 10.654 |  |
| 668219850.0 | -327.626 | 10.496 |  |
| 668567700.0 | -336.828 | 10.339 |  |
| 668915550.0 | -346.018 | 10.183 |  |
| 669263400.0 | -355.199 | 10.028 |  |
| 669611250.0 | -364.368 | 9.873 |  |
| 669959100.0 | -373.527 | 9.719 |  |
| 670306950.0 | -382.674 | 9.565 |  |
| 670654800.0 | -391.809 | 9.413 |  |
| 671002650.0 | -400.932 | 9.26 |  |
| 671350500.0 | -410.043 | 9.109 |  |
| 671698350.0 | -419.142 | 8.958 |  |
| 672046200.0 | -428.228 | 8.808 |  |
| 672394050.0 | -437.301 | 8.659 |  |
| 672741900.0 | -446.36 | 8.51 |  |
| 673089750.0 | -455.406 | 8.362 |  |
| 673437600.0 | -464.438 | 8.214 |  |
| 673785450.0 | -473.456 | 8.067 |  |
| 674133300.0 | -482.459 | 7.921 |  |
| 674481150.0 | -491.448 | 7.776 |  |
| 674829000.0 | -500.422 | 7.631 |  |
| 675176850.0 | -509.38 | 7.486 |  |
| 675524700.0 | -518.322 | 7.343 |  |
| 675872550.0 | -527.249 | 7.2 |  |
| 676220400.0 | -536.16 | 7.057 |  |
| 676568250.0 | -545.054 | 6.915 |  |
| 676916100.0 | -553.931 | 6.774 |  |
| 677263950.0 | -562.791 | 6.634 |  |
| 677611800.0 | -571.634 | 6.494 |  |
| 677959650.0 | -580.459 | 6.354 |  |
| 678307500.0 | -589.266 | 6.216 |  |
| 678655350.0 | -598.055 | 6.077 |  |
| 679003200.0 | -606.825 | 5.94 |  |
| 679351050.0 | -615.577 | 5.803 |  |
| 679698900.0 | -624.309 | 5.667 |  |
| 680046750.0 | -633.022 | 5.531 |  |
| 680394600.0 | -641.715 | 5.396 |  |
| 680742450.0 | -650.389 | 5.261 |  |
| 681090300.0 | -659.041 | 5.127 |  |
| 681438150.0 | -667.674 | 4.994 |  |
| 681786000.0 | -676.285 | 4.861 |  |
| 682133850.0 | -684.875 | 4.729 |  |
| 682481700.0 | -693.443 | 4.597 |  |
| 682829550.0 | -701.99 | 4.466 |  |
| 683177400.0 | -710.515 | 4.336 |  |
| 683525250.0 | -719.017 | 4.206 |  |
| 683873100.0 | -727.496 | 4.077 |  |
| 684220950.0 | -735.952 | 3.948 |  |
| 684568800.0 | -744.385 | 3.82 |  |
| 684916650.0 | -752.794 | 3.692 |  |
| 685264500.0 | -761.179 | 3.565 |  |
| 685612350.0 | -769.54 | 3.438 |  |
| 685960200.0 | -777.876 | 3.312 |  |
| 686308050.0 | -786.187 | 3.187 |  |
| 686655900.0 | -794.473 | 3.062 |  |
| 687003750.0 | -802.733 | 2.938 |  |
| 687351600.0 | -810.968 | 2.814 |  |
| 687699450.0 | -819.176 | 2.691 |  |
| 688047300.0 | -827.358 | 2.568 |  |
| 688395150.0 | -835.513 | 2.446 |  |
| 688743000.0 | -843.641 | 2.324 |  |
| 689090850.0 | -851.741 | 2.203 |  |
| 689438700.0 | -859.814 | 2.082 |  |
| 689786550.0 | -867.858 | 1.962 |  |
| 690134400.0 | -875.874 | 1.843 |  |
| 690482250.0 | -883.862 | 1.724 |  |
| 690830100.0 | -891.82 | 1.605 |  |
| 691177950.0 | -899.749 | 1.487 |  |
| 691525800.0 | -907.648 | 1.37 |  |
| 691873650.0 | -915.517 | 1.253 |  |
| 692221500.0 | -923.355 | 1.137 |  |
| 692569350.0 | -931.163 | 1.021 |  |
| 692917200.0 | -938.94 | 0.905 |  |
| 693265050.0 | -946.686 | 0.79 |  |
| 693612900.0 | -954.4 | 0.676 |  |
| 693960750.0 | -962.082 | 0.562 |  |
| 694308600.0 | -969.732 | 0.449 |  |
| 694656450.0 | -977.349 | 0.336 |  |
| 695004300.0 | -984.932 | 0.223 |  |
| 695352150.0 | -992.483 | 0.111 |  |
| 695700000.0 | -1000 | 0 |  |